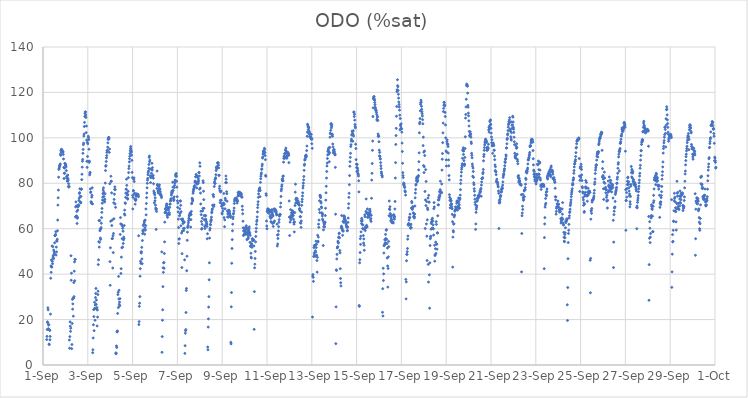
| Category | ODO (%sat) |
|---|---|
| 44440.166666666664 | 11.2 |
| 44440.177083333336 | 12.6 |
| 44440.1875 | 15.6 |
| 44440.197916666664 | 19 |
| 44440.208333333336 | 18.6 |
| 44440.21875 | 25.2 |
| 44440.229166666664 | 24.3 |
| 44440.239583333336 | 16 |
| 44440.25 | 17.6 |
| 44440.260416666664 | 17.8 |
| 44440.270833333336 | 9.2 |
| 44440.28125 | 9 |
| 44440.291666666664 | 15.5 |
| 44440.302083333336 | 15.2 |
| 44440.3125 | 11.1 |
| 44440.322916666664 | 12.6 |
| 44440.333333333336 | 22.4 |
| 44440.34375 | 38.2 |
| 44440.354166666664 | 43.6 |
| 44440.364583333336 | 40.8 |
| 44440.375 | 46.3 |
| 44440.385416666664 | 43.2 |
| 44440.395833333336 | 43.1 |
| 44440.40625 | 52.4 |
| 44440.416666666664 | 45.6 |
| 44440.427083333336 | 44.6 |
| 44440.4375 | 52.1 |
| 44440.447916666664 | 48 |
| 44440.458333333336 | 47.3 |
| 44440.46875 | 46.8 |
| 44440.479166666664 | 50.6 |
| 44440.489583333336 | 48.6 |
| 44440.5 | 49.9 |
| 44440.510416666664 | 49.2 |
| 44440.520833333336 | 53.8 |
| 44440.53125 | 57 |
| 44440.541666666664 | 56.9 |
| 44440.552083333336 | 57.2 |
| 44440.5625 | 57.5 |
| 44440.572916666664 | 58.7 |
| 44440.583333333336 | 48.4 |
| 44440.59375 | 51.9 |
| 44440.604166666664 | 49.8 |
| 44440.614583333336 | 54.7 |
| 44440.625 | 54.5 |
| 44440.635416666664 | 55.4 |
| 44440.645833333336 | 59.1 |
| 44440.65625 | 63.8 |
| 44440.666666666664 | 70.4 |
| 44440.677083333336 | 73.6 |
| 44440.6875 | 77 |
| 44440.697916666664 | 82.7 |
| 44440.708333333336 | 86.1 |
| 44440.71875 | 86.4 |
| 44440.729166666664 | 87.1 |
| 44440.739583333336 | 87.8 |
| 44440.75 | 87.6 |
| 44440.760416666664 | 88.1 |
| 44440.770833333336 | 88.5 |
| 44440.78125 | 92.9 |
| 44440.791666666664 | 92.3 |
| 44440.802083333336 | 94.5 |
| 44440.8125 | 93.8 |
| 44440.822916666664 | 95 |
| 44440.833333333336 | 94.3 |
| 44440.84375 | 94.7 |
| 44440.854166666664 | 94.1 |
| 44440.864583333336 | 94.3 |
| 44440.875 | 93.8 |
| 44440.885416666664 | 93.7 |
| 44440.895833333336 | 93.9 |
| 44440.90625 | 92.7 |
| 44440.916666666664 | 90.7 |
| 44440.927083333336 | 87 |
| 44440.9375 | 82.1 |
| 44440.947916666664 | 84.4 |
| 44440.958333333336 | 86.7 |
| 44440.96875 | 84.4 |
| 44440.979166666664 | 88.8 |
| 44440.989583333336 | 88.6 |
| 44441.0 | 88.1 |
| 44441.010416666664 | 88.1 |
| 44441.020833333336 | 88 |
| 44441.03125 | 87.2 |
| 44441.041666666664 | 85.6 |
| 44441.052083333336 | 82.8 |
| 44441.0625 | 82.2 |
| 44441.072916666664 | 83.2 |
| 44441.083333333336 | 81 |
| 44441.09375 | 81 |
| 44441.104166666664 | 83.6 |
| 44441.114583333336 | 82.1 |
| 44441.125 | 81.4 |
| 44441.135416666664 | 78.6 |
| 44441.145833333336 | 79.8 |
| 44441.15625 | 78.3 |
| 44441.166666666664 | 78.6 |
| 44441.177083333336 | 11 |
| 44441.1875 | 7.4 |
| 44441.197916666664 | 12.5 |
| 44441.208333333336 | 19 |
| 44441.21875 | 17.1 |
| 44441.229166666664 | 14.8 |
| 44441.239583333336 | 16.2 |
| 44441.25 | 48.1 |
| 44441.260416666664 | 37.3 |
| 44441.270833333336 | 40.4 |
| 44441.28125 | 7.2 |
| 44441.291666666664 | 9 |
| 44441.302083333336 | 18.3 |
| 44441.3125 | 28.9 |
| 44441.322916666664 | 24.6 |
| 44441.333333333336 | 26.9 |
| 44441.34375 | 29.4 |
| 44441.354166666664 | 21.5 |
| 44441.364583333336 | 29.4 |
| 44441.375 | 36.3 |
| 44441.385416666664 | 30.1 |
| 44441.395833333336 | 41.3 |
| 44441.40625 | 45.4 |
| 44441.416666666664 | 37.1 |
| 44441.427083333336 | 46.5 |
| 44441.4375 | 46.5 |
| 44441.447916666664 | 65.2 |
| 44441.458333333336 | 69.6 |
| 44441.46875 | 71.8 |
| 44441.479166666664 | 65.5 |
| 44441.489583333336 | 70 |
| 44441.5 | 65.6 |
| 44441.510416666664 | 67.6 |
| 44441.520833333336 | 62.3 |
| 44441.53125 | 64.6 |
| 44441.541666666664 | 65 |
| 44441.552083333336 | 68.2 |
| 44441.5625 | 69.6 |
| 44441.572916666664 | 70.5 |
| 44441.583333333336 | 70.1 |
| 44441.59375 | 70.2 |
| 44441.604166666664 | 72.4 |
| 44441.614583333336 | 73.4 |
| 44441.625 | 75.5 |
| 44441.635416666664 | 75.9 |
| 44441.645833333336 | 77.6 |
| 44441.65625 | 74.2 |
| 44441.666666666664 | 71.8 |
| 44441.677083333336 | 71.4 |
| 44441.6875 | 71.5 |
| 44441.697916666664 | 74.2 |
| 44441.708333333336 | 77.3 |
| 44441.71875 | 77.5 |
| 44441.729166666664 | 81.6 |
| 44441.739583333336 | 84 |
| 44441.75 | 87.1 |
| 44441.760416666664 | 89.7 |
| 44441.770833333336 | 90.5 |
| 44441.78125 | 93.2 |
| 44441.791666666664 | 94.9 |
| 44441.802083333336 | 97 |
| 44441.8125 | 97.7 |
| 44441.822916666664 | 100.8 |
| 44441.833333333336 | 101.7 |
| 44441.84375 | 105 |
| 44441.854166666664 | 106.8 |
| 44441.864583333336 | 109.4 |
| 44441.875 | 110.8 |
| 44441.885416666664 | 111.4 |
| 44441.895833333336 | 111.4 |
| 44441.90625 | 110.1 |
| 44441.916666666664 | 109 |
| 44441.927083333336 | 102.3 |
| 44441.9375 | 105.2 |
| 44441.947916666664 | 99 |
| 44441.958333333336 | 89.7 |
| 44441.96875 | 87 |
| 44441.979166666664 | 98 |
| 44441.989583333336 | 91.8 |
| 44442.0 | 97.4 |
| 44442.010416666664 | 89.7 |
| 44442.020833333336 | 100.7 |
| 44442.03125 | 100 |
| 44442.041666666664 | 99.2 |
| 44442.052083333336 | 95 |
| 44442.0625 | 89.2 |
| 44442.072916666664 | 89.7 |
| 44442.083333333336 | 83.7 |
| 44442.09375 | 84.5 |
| 44442.104166666664 | 84.8 |
| 44442.114583333336 | 77.5 |
| 44442.125 | 75.9 |
| 44442.135416666664 | 76.2 |
| 44442.145833333336 | 71.9 |
| 44442.15625 | 71.6 |
| 44442.166666666664 | 71.2 |
| 44442.177083333336 | 73.9 |
| 44442.1875 | 74.7 |
| 44442.197916666664 | 78 |
| 44442.208333333336 | 70.9 |
| 44442.21875 | 5.4 |
| 44442.229166666664 | 6.7 |
| 44442.239583333336 | 11.9 |
| 44442.25 | 17.7 |
| 44442.260416666664 | 24.4 |
| 44442.270833333336 | 21.3 |
| 44442.28125 | 15.1 |
| 44442.291666666664 | 24.6 |
| 44442.302083333336 | 27.6 |
| 44442.3125 | 25 |
| 44442.322916666664 | 19.7 |
| 44442.333333333336 | 26.4 |
| 44442.34375 | 29.7 |
| 44442.354166666664 | 31.5 |
| 44442.364583333336 | 33.7 |
| 44442.375 | 26.7 |
| 44442.385416666664 | 28.6 |
| 44442.395833333336 | 24.8 |
| 44442.40625 | 25.3 |
| 44442.416666666664 | 17.2 |
| 44442.427083333336 | 24.2 |
| 44442.4375 | 21.1 |
| 44442.447916666664 | 31 |
| 44442.458333333336 | 32.5 |
| 44442.46875 | 44.2 |
| 44442.479166666664 | 46.3 |
| 44442.489583333336 | 54.3 |
| 44442.5 | 63.6 |
| 44442.510416666664 | 51.9 |
| 44442.520833333336 | 54 |
| 44442.53125 | 63.6 |
| 44442.541666666664 | 59.1 |
| 44442.552083333336 | 59.8 |
| 44442.5625 | 55.9 |
| 44442.572916666664 | 55.3 |
| 44442.583333333336 | 60 |
| 44442.59375 | 60.5 |
| 44442.604166666664 | 62.4 |
| 44442.614583333336 | 64.9 |
| 44442.625 | 67.2 |
| 44442.635416666664 | 68.9 |
| 44442.645833333336 | 71.2 |
| 44442.65625 | 72.6 |
| 44442.666666666664 | 73.9 |
| 44442.677083333336 | 75.4 |
| 44442.6875 | 77 |
| 44442.697916666664 | 78 |
| 44442.708333333336 | 76.1 |
| 44442.71875 | 74.2 |
| 44442.729166666664 | 72.7 |
| 44442.739583333336 | 72.1 |
| 44442.75 | 71.8 |
| 44442.760416666664 | 73 |
| 44442.770833333336 | 75.4 |
| 44442.78125 | 80.1 |
| 44442.791666666664 | 85.6 |
| 44442.802083333336 | 87.5 |
| 44442.8125 | 87.8 |
| 44442.822916666664 | 89.6 |
| 44442.833333333336 | 91.2 |
| 44442.84375 | 92.2 |
| 44442.854166666664 | 93.6 |
| 44442.864583333336 | 94.5 |
| 44442.875 | 94.3 |
| 44442.885416666664 | 95.9 |
| 44442.895833333336 | 97.8 |
| 44442.90625 | 99.3 |
| 44442.916666666664 | 100 |
| 44442.927083333336 | 100.1 |
| 44442.9375 | 100.2 |
| 44442.947916666664 | 99.5 |
| 44442.958333333336 | 93.6 |
| 44442.96875 | 95.1 |
| 44442.979166666664 | 79.8 |
| 44442.989583333336 | 45.5 |
| 44443.0 | 35.1 |
| 44443.010416666664 | 51.6 |
| 44443.020833333336 | 63.3 |
| 44443.03125 | 83.1 |
| 44443.041666666664 | 80.8 |
| 44443.052083333336 | 80.9 |
| 44443.0625 | 75.8 |
| 44443.072916666664 | 61.4 |
| 44443.083333333336 | 55.6 |
| 44443.09375 | 63.8 |
| 44443.104166666664 | 55.7 |
| 44443.114583333336 | 42.7 |
| 44443.125 | 56.9 |
| 44443.135416666664 | 49.5 |
| 44443.145833333336 | 57.9 |
| 44443.15625 | 71.4 |
| 44443.166666666664 | 64.4 |
| 44443.177083333336 | 72.9 |
| 44443.1875 | 75.2 |
| 44443.197916666664 | 77.3 |
| 44443.208333333336 | 78.4 |
| 44443.21875 | 70.9 |
| 44443.229166666664 | 77.2 |
| 44443.239583333336 | 69.4 |
| 44443.25 | 5.3 |
| 44443.260416666664 | 4.9 |
| 44443.270833333336 | 5.2 |
| 44443.28125 | 8.4 |
| 44443.291666666664 | 7.7 |
| 44443.302083333336 | 14.6 |
| 44443.3125 | 14.6 |
| 44443.322916666664 | 15 |
| 44443.333333333336 | 22.7 |
| 44443.34375 | 31 |
| 44443.354166666664 | 32 |
| 44443.364583333336 | 25.3 |
| 44443.375 | 39 |
| 44443.385416666664 | 29.1 |
| 44443.395833333336 | 32.9 |
| 44443.40625 | 26.7 |
| 44443.416666666664 | 27.7 |
| 44443.427083333336 | 26.1 |
| 44443.4375 | 29.2 |
| 44443.447916666664 | 57.5 |
| 44443.458333333336 | 64.9 |
| 44443.46875 | 62.1 |
| 44443.479166666664 | 40.3 |
| 44443.489583333336 | 42.4 |
| 44443.5 | 47.5 |
| 44443.510416666664 | 61.9 |
| 44443.520833333336 | 51.6 |
| 44443.53125 | 55.6 |
| 44443.541666666664 | 61.2 |
| 44443.552083333336 | 51.9 |
| 44443.5625 | 60.2 |
| 44443.572916666664 | 58.9 |
| 44443.583333333336 | 53.5 |
| 44443.59375 | 55.1 |
| 44443.604166666664 | 56.3 |
| 44443.614583333336 | 55.6 |
| 44443.625 | 61.4 |
| 44443.635416666664 | 66.5 |
| 44443.645833333336 | 68.2 |
| 44443.65625 | 66 |
| 44443.666666666664 | 71.4 |
| 44443.677083333336 | 71.1 |
| 44443.6875 | 73.8 |
| 44443.697916666664 | 75.7 |
| 44443.708333333336 | 77.4 |
| 44443.71875 | 77.4 |
| 44443.729166666664 | 81.8 |
| 44443.739583333336 | 79.1 |
| 44443.75 | 75.7 |
| 44443.760416666664 | 74.9 |
| 44443.770833333336 | 73.4 |
| 44443.78125 | 73 |
| 44443.791666666664 | 74.9 |
| 44443.802083333336 | 76.5 |
| 44443.8125 | 82.5 |
| 44443.822916666664 | 84.7 |
| 44443.833333333336 | 86.5 |
| 44443.84375 | 87.6 |
| 44443.854166666664 | 89.4 |
| 44443.864583333336 | 90.8 |
| 44443.875 | 91.9 |
| 44443.885416666664 | 93.1 |
| 44443.895833333336 | 94.3 |
| 44443.90625 | 95.4 |
| 44443.916666666664 | 96.2 |
| 44443.927083333336 | 95 |
| 44443.9375 | 94.2 |
| 44443.947916666664 | 93.8 |
| 44443.958333333336 | 92.4 |
| 44443.96875 | 90.1 |
| 44443.979166666664 | 84.8 |
| 44443.989583333336 | 82.5 |
| 44444.0 | 74.7 |
| 44444.010416666664 | 68.7 |
| 44444.020833333336 | 73.8 |
| 44444.03125 | 76.7 |
| 44444.041666666664 | 76.8 |
| 44444.052083333336 | 81.8 |
| 44444.0625 | 82.4 |
| 44444.072916666664 | 80.8 |
| 44444.083333333336 | 75.3 |
| 44444.09375 | 75.6 |
| 44444.104166666664 | 72.9 |
| 44444.114583333336 | 70.8 |
| 44444.125 | 73.1 |
| 44444.135416666664 | 72.4 |
| 44444.145833333336 | 72.9 |
| 44444.15625 | 74.3 |
| 44444.166666666664 | 74.5 |
| 44444.177083333336 | 75.3 |
| 44444.1875 | 74.7 |
| 44444.197916666664 | 75.3 |
| 44444.208333333336 | 74.7 |
| 44444.21875 | 74.7 |
| 44444.229166666664 | 75 |
| 44444.239583333336 | 75.1 |
| 44444.25 | 74.5 |
| 44444.260416666664 | 74.1 |
| 44444.270833333336 | 56.9 |
| 44444.28125 | 17.8 |
| 44444.291666666664 | 19.1 |
| 44444.302083333336 | 25.8 |
| 44444.3125 | 27.2 |
| 44444.322916666664 | 30.1 |
| 44444.333333333336 | 39.1 |
| 44444.34375 | 42.4 |
| 44444.354166666664 | 45.7 |
| 44444.364583333336 | 44.8 |
| 44444.375 | 49.8 |
| 44444.385416666664 | 49.3 |
| 44444.395833333336 | 49.8 |
| 44444.40625 | 51.8 |
| 44444.416666666664 | 46.7 |
| 44444.427083333336 | 44.6 |
| 44444.4375 | 54.8 |
| 44444.447916666664 | 57.8 |
| 44444.458333333336 | 59.3 |
| 44444.46875 | 58.7 |
| 44444.479166666664 | 61.4 |
| 44444.489583333336 | 59.4 |
| 44444.5 | 61.8 |
| 44444.510416666664 | 62.1 |
| 44444.520833333336 | 62.9 |
| 44444.53125 | 63.5 |
| 44444.541666666664 | 57.6 |
| 44444.552083333336 | 60.4 |
| 44444.5625 | 63.8 |
| 44444.572916666664 | 59.4 |
| 44444.583333333336 | 61.4 |
| 44444.59375 | 68.7 |
| 44444.604166666664 | 66.1 |
| 44444.614583333336 | 71.1 |
| 44444.625 | 73.7 |
| 44444.635416666664 | 75.7 |
| 44444.645833333336 | 78 |
| 44444.65625 | 80 |
| 44444.666666666664 | 81.4 |
| 44444.677083333336 | 82.2 |
| 44444.6875 | 83.8 |
| 44444.697916666664 | 84.7 |
| 44444.708333333336 | 85.4 |
| 44444.71875 | 86.6 |
| 44444.729166666664 | 88.3 |
| 44444.739583333336 | 91.4 |
| 44444.75 | 92 |
| 44444.760416666664 | 89.5 |
| 44444.770833333336 | 90.2 |
| 44444.78125 | 86.3 |
| 44444.791666666664 | 83.3 |
| 44444.802083333336 | 80.3 |
| 44444.8125 | 82.5 |
| 44444.822916666664 | 82.8 |
| 44444.833333333336 | 83 |
| 44444.84375 | 84.4 |
| 44444.854166666664 | 86.1 |
| 44444.864583333336 | 88.8 |
| 44444.875 | 85.8 |
| 44444.885416666664 | 86.9 |
| 44444.895833333336 | 82.6 |
| 44444.90625 | 83.2 |
| 44444.916666666664 | 83.5 |
| 44444.927083333336 | 82.2 |
| 44444.9375 | 79.8 |
| 44444.947916666664 | 76.6 |
| 44444.958333333336 | 75.7 |
| 44444.96875 | 71.4 |
| 44444.979166666664 | 75.8 |
| 44444.989583333336 | 74.9 |
| 44445.0 | 72.3 |
| 44445.010416666664 | 73.6 |
| 44445.020833333336 | 70.4 |
| 44445.03125 | 69.1 |
| 44445.041666666664 | 68.4 |
| 44445.052083333336 | 59.7 |
| 44445.0625 | 68.8 |
| 44445.072916666664 | 67.6 |
| 44445.083333333336 | 77.7 |
| 44445.09375 | 85.4 |
| 44445.104166666664 | 79.1 |
| 44445.114583333336 | 79.5 |
| 44445.125 | 79.1 |
| 44445.135416666664 | 76.5 |
| 44445.145833333336 | 75.7 |
| 44445.15625 | 78.6 |
| 44445.166666666664 | 77 |
| 44445.177083333336 | 78.7 |
| 44445.1875 | 77.1 |
| 44445.197916666664 | 79.3 |
| 44445.208333333336 | 77.7 |
| 44445.21875 | 77.3 |
| 44445.229166666664 | 75.3 |
| 44445.239583333336 | 76.2 |
| 44445.25 | 74.8 |
| 44445.260416666664 | 75.1 |
| 44445.270833333336 | 74.6 |
| 44445.28125 | 74.3 |
| 44445.291666666664 | 73.7 |
| 44445.302083333336 | 49.8 |
| 44445.3125 | 5.6 |
| 44445.322916666664 | 12.5 |
| 44445.333333333336 | 19.7 |
| 44445.34375 | 24.3 |
| 44445.354166666664 | 34.5 |
| 44445.364583333336 | 42.8 |
| 44445.375 | 40.8 |
| 44445.385416666664 | 45 |
| 44445.395833333336 | 45.1 |
| 44445.40625 | 42.6 |
| 44445.416666666664 | 49.1 |
| 44445.427083333336 | 54.2 |
| 44445.4375 | 62.9 |
| 44445.447916666664 | 67 |
| 44445.458333333336 | 68.7 |
| 44445.46875 | 67.2 |
| 44445.479166666664 | 67.5 |
| 44445.489583333336 | 68.4 |
| 44445.5 | 69.5 |
| 44445.510416666664 | 70.2 |
| 44445.520833333336 | 70.9 |
| 44445.53125 | 70.7 |
| 44445.541666666664 | 65.8 |
| 44445.552083333336 | 66.6 |
| 44445.5625 | 65 |
| 44445.572916666664 | 68.4 |
| 44445.583333333336 | 69.4 |
| 44445.59375 | 68.8 |
| 44445.604166666664 | 68.3 |
| 44445.614583333336 | 66.7 |
| 44445.625 | 66.5 |
| 44445.635416666664 | 67.1 |
| 44445.645833333336 | 66.2 |
| 44445.65625 | 69.4 |
| 44445.666666666664 | 70.8 |
| 44445.677083333336 | 70.9 |
| 44445.6875 | 72.2 |
| 44445.697916666664 | 72.4 |
| 44445.708333333336 | 73 |
| 44445.71875 | 73.2 |
| 44445.729166666664 | 74.8 |
| 44445.739583333336 | 75.8 |
| 44445.75 | 76.5 |
| 44445.760416666664 | 75.6 |
| 44445.770833333336 | 76.1 |
| 44445.78125 | 76.7 |
| 44445.791666666664 | 80.5 |
| 44445.802083333336 | 78.3 |
| 44445.8125 | 76.8 |
| 44445.822916666664 | 73.5 |
| 44445.833333333336 | 72.4 |
| 44445.84375 | 72.8 |
| 44445.854166666664 | 74 |
| 44445.864583333336 | 78.1 |
| 44445.875 | 79.1 |
| 44445.885416666664 | 80.1 |
| 44445.895833333336 | 81.4 |
| 44445.90625 | 81 |
| 44445.916666666664 | 83.8 |
| 44445.927083333336 | 83.1 |
| 44445.9375 | 83.6 |
| 44445.947916666664 | 84.3 |
| 44445.958333333336 | 83.1 |
| 44445.96875 | 80.9 |
| 44445.979166666664 | 78.3 |
| 44445.989583333336 | 74.1 |
| 44446.0 | 72.3 |
| 44446.010416666664 | 69.4 |
| 44446.020833333336 | 71.3 |
| 44446.03125 | 67.4 |
| 44446.041666666664 | 64.2 |
| 44446.052083333336 | 60.5 |
| 44446.0625 | 53.5 |
| 44446.072916666664 | 55.4 |
| 44446.083333333336 | 55.6 |
| 44446.09375 | 65.7 |
| 44446.104166666664 | 68.8 |
| 44446.114583333336 | 66.7 |
| 44446.125 | 72.1 |
| 44446.135416666664 | 72.3 |
| 44446.145833333336 | 70.3 |
| 44446.15625 | 61.3 |
| 44446.166666666664 | 67.5 |
| 44446.177083333336 | 64.2 |
| 44446.1875 | 58.1 |
| 44446.197916666664 | 42.9 |
| 44446.208333333336 | 49 |
| 44446.21875 | 58.9 |
| 44446.229166666664 | 63.6 |
| 44446.239583333336 | 64.3 |
| 44446.25 | 62.3 |
| 44446.260416666664 | 63.1 |
| 44446.270833333336 | 60.1 |
| 44446.28125 | 59.2 |
| 44446.291666666664 | 63.1 |
| 44446.302083333336 | 62.8 |
| 44446.3125 | 60.2 |
| 44446.322916666664 | 46.3 |
| 44446.333333333336 | 5.1 |
| 44446.34375 | 8.5 |
| 44446.354166666664 | 14 |
| 44446.364583333336 | 15.1 |
| 44446.375 | 15.6 |
| 44446.385416666664 | 23.1 |
| 44446.395833333336 | 32.8 |
| 44446.40625 | 33.7 |
| 44446.416666666664 | 41.5 |
| 44446.427083333336 | 47.9 |
| 44446.4375 | 54.9 |
| 44446.447916666664 | 58.5 |
| 44446.458333333336 | 60.6 |
| 44446.46875 | 60.8 |
| 44446.479166666664 | 61.5 |
| 44446.489583333336 | 62.6 |
| 44446.5 | 63.5 |
| 44446.510416666664 | 64.6 |
| 44446.520833333336 | 65.6 |
| 44446.53125 | 64.2 |
| 44446.541666666664 | 66.2 |
| 44446.552083333336 | 65.9 |
| 44446.5625 | 66.7 |
| 44446.572916666664 | 67 |
| 44446.583333333336 | 66.5 |
| 44446.59375 | 60.7 |
| 44446.604166666664 | 64 |
| 44446.614583333336 | 66.2 |
| 44446.625 | 67.6 |
| 44446.635416666664 | 71 |
| 44446.645833333336 | 71.3 |
| 44446.65625 | 73.4 |
| 44446.666666666664 | 73.1 |
| 44446.677083333336 | 72.2 |
| 44446.6875 | 72.6 |
| 44446.697916666664 | 75.6 |
| 44446.708333333336 | 76.3 |
| 44446.71875 | 77 |
| 44446.729166666664 | 77.4 |
| 44446.739583333336 | 77.8 |
| 44446.75 | 78.6 |
| 44446.760416666664 | 78.3 |
| 44446.770833333336 | 79 |
| 44446.78125 | 80.5 |
| 44446.791666666664 | 81 |
| 44446.802083333336 | 80.8 |
| 44446.8125 | 82.9 |
| 44446.822916666664 | 82.9 |
| 44446.833333333336 | 83.9 |
| 44446.84375 | 80.3 |
| 44446.854166666664 | 80 |
| 44446.864583333336 | 78 |
| 44446.875 | 79.6 |
| 44446.885416666664 | 83.2 |
| 44446.895833333336 | 82.7 |
| 44446.90625 | 80.7 |
| 44446.916666666664 | 80.4 |
| 44446.927083333336 | 80 |
| 44446.9375 | 81.9 |
| 44446.947916666664 | 81 |
| 44446.958333333336 | 84.7 |
| 44446.96875 | 84.7 |
| 44446.979166666664 | 83.2 |
| 44446.989583333336 | 77.4 |
| 44447.0 | 89 |
| 44447.010416666664 | 87.5 |
| 44447.020833333336 | 77.9 |
| 44447.03125 | 75.7 |
| 44447.041666666664 | 70.9 |
| 44447.052083333336 | 67.7 |
| 44447.0625 | 66.2 |
| 44447.072916666664 | 63.2 |
| 44447.083333333336 | 59.8 |
| 44447.09375 | 60.1 |
| 44447.104166666664 | 61.9 |
| 44447.114583333336 | 64.6 |
| 44447.125 | 67.8 |
| 44447.135416666664 | 68.9 |
| 44447.145833333336 | 81.1 |
| 44447.15625 | 80.3 |
| 44447.166666666664 | 76.5 |
| 44447.177083333336 | 72.8 |
| 44447.1875 | 69 |
| 44447.197916666664 | 65.8 |
| 44447.208333333336 | 63.9 |
| 44447.21875 | 61.1 |
| 44447.229166666664 | 60.1 |
| 44447.239583333336 | 65.6 |
| 44447.25 | 63.8 |
| 44447.260416666664 | 65.8 |
| 44447.270833333336 | 64.2 |
| 44447.28125 | 61.7 |
| 44447.291666666664 | 63.2 |
| 44447.302083333336 | 62.5 |
| 44447.3125 | 62.1 |
| 44447.322916666664 | 61 |
| 44447.333333333336 | 55.6 |
| 44447.34375 | 57.8 |
| 44447.354166666664 | 7.9 |
| 44447.364583333336 | 6.7 |
| 44447.375 | 16.7 |
| 44447.385416666664 | 20.3 |
| 44447.395833333336 | 25.5 |
| 44447.40625 | 30.1 |
| 44447.416666666664 | 37.5 |
| 44447.427083333336 | 45 |
| 44447.4375 | 55.9 |
| 44447.447916666664 | 59.4 |
| 44447.458333333336 | 60.2 |
| 44447.46875 | 61.9 |
| 44447.479166666664 | 61.7 |
| 44447.489583333336 | 63.1 |
| 44447.5 | 63.6 |
| 44447.510416666664 | 64.1 |
| 44447.520833333336 | 65.1 |
| 44447.53125 | 67 |
| 44447.541666666664 | 67.4 |
| 44447.552083333336 | 68.3 |
| 44447.5625 | 68.8 |
| 44447.572916666664 | 70.3 |
| 44447.583333333336 | 70.3 |
| 44447.59375 | 74.9 |
| 44447.604166666664 | 75 |
| 44447.614583333336 | 74.1 |
| 44447.625 | 69.8 |
| 44447.635416666664 | 70.5 |
| 44447.645833333336 | 78.6 |
| 44447.65625 | 80.6 |
| 44447.666666666664 | 80 |
| 44447.677083333336 | 81.6 |
| 44447.6875 | 79.9 |
| 44447.697916666664 | 82 |
| 44447.708333333336 | 82.5 |
| 44447.71875 | 83.8 |
| 44447.729166666664 | 85.6 |
| 44447.739583333336 | 87 |
| 44447.75 | 86.4 |
| 44447.760416666664 | 87.3 |
| 44447.770833333336 | 87.2 |
| 44447.78125 | 86.8 |
| 44447.791666666664 | 89 |
| 44447.802083333336 | 88.9 |
| 44447.8125 | 88.9 |
| 44447.822916666664 | 89 |
| 44447.833333333336 | 88 |
| 44447.84375 | 86.8 |
| 44447.854166666664 | 83.5 |
| 44447.864583333336 | 83.5 |
| 44447.875 | 77.7 |
| 44447.885416666664 | 78.7 |
| 44447.895833333336 | 76.7 |
| 44447.90625 | 71.5 |
| 44447.916666666664 | 72.5 |
| 44447.927083333336 | 76.2 |
| 44447.9375 | 76.5 |
| 44447.947916666664 | 76.6 |
| 44447.958333333336 | 72.5 |
| 44447.96875 | 69.9 |
| 44447.979166666664 | 71 |
| 44447.989583333336 | 66.9 |
| 44448.0 | 66.5 |
| 44448.010416666664 | 70.6 |
| 44448.020833333336 | 68.9 |
| 44448.03125 | 67.8 |
| 44448.041666666664 | 70.4 |
| 44448.052083333336 | 71 |
| 44448.0625 | 71.3 |
| 44448.072916666664 | 75.5 |
| 44448.083333333336 | 64.9 |
| 44448.09375 | 70.8 |
| 44448.104166666664 | 60.9 |
| 44448.114583333336 | 63.9 |
| 44448.125 | 68.8 |
| 44448.135416666664 | 73.4 |
| 44448.145833333336 | 72.6 |
| 44448.15625 | 80.3 |
| 44448.166666666664 | 83.2 |
| 44448.177083333336 | 81.8 |
| 44448.1875 | 80.3 |
| 44448.197916666664 | 76.3 |
| 44448.208333333336 | 75.4 |
| 44448.21875 | 72.1 |
| 44448.229166666664 | 67.9 |
| 44448.239583333336 | 65.2 |
| 44448.25 | 66.5 |
| 44448.260416666664 | 67.4 |
| 44448.270833333336 | 67.7 |
| 44448.28125 | 65.1 |
| 44448.291666666664 | 66.5 |
| 44448.302083333336 | 68.2 |
| 44448.3125 | 67.9 |
| 44448.322916666664 | 67.5 |
| 44448.333333333336 | 66.8 |
| 44448.34375 | 66.1 |
| 44448.354166666664 | 65.8 |
| 44448.364583333336 | 65.5 |
| 44448.375 | 65 |
| 44448.385416666664 | 10 |
| 44448.395833333336 | 9.3 |
| 44448.40625 | 25.6 |
| 44448.416666666664 | 31.9 |
| 44448.427083333336 | 44.8 |
| 44448.4375 | 51.3 |
| 44448.447916666664 | 55.2 |
| 44448.458333333336 | 59.1 |
| 44448.46875 | 62 |
| 44448.479166666664 | 64.4 |
| 44448.489583333336 | 65.2 |
| 44448.5 | 66.5 |
| 44448.510416666664 | 66.8 |
| 44448.520833333336 | 67.9 |
| 44448.53125 | 69.1 |
| 44448.541666666664 | 71.1 |
| 44448.552083333336 | 72.2 |
| 44448.5625 | 72.8 |
| 44448.572916666664 | 73.3 |
| 44448.583333333336 | 73 |
| 44448.59375 | 73.2 |
| 44448.604166666664 | 72.8 |
| 44448.614583333336 | 73.5 |
| 44448.625 | 73.1 |
| 44448.635416666664 | 72.7 |
| 44448.645833333336 | 72.8 |
| 44448.65625 | 72.9 |
| 44448.666666666664 | 71.3 |
| 44448.677083333336 | 72.4 |
| 44448.6875 | 72.1 |
| 44448.697916666664 | 74.3 |
| 44448.708333333336 | 75.9 |
| 44448.71875 | 74.9 |
| 44448.729166666664 | 75.3 |
| 44448.739583333336 | 76 |
| 44448.75 | 76.2 |
| 44448.760416666664 | 74.8 |
| 44448.770833333336 | 74.9 |
| 44448.78125 | 74.8 |
| 44448.791666666664 | 75.7 |
| 44448.802083333336 | 75.5 |
| 44448.8125 | 75.8 |
| 44448.822916666664 | 75.6 |
| 44448.833333333336 | 75.6 |
| 44448.84375 | 75.6 |
| 44448.854166666664 | 75 |
| 44448.864583333336 | 74.2 |
| 44448.875 | 73.9 |
| 44448.885416666664 | 73.9 |
| 44448.895833333336 | 69.9 |
| 44448.90625 | 68.3 |
| 44448.916666666664 | 66.6 |
| 44448.927083333336 | 63.3 |
| 44448.9375 | 60.4 |
| 44448.947916666664 | 57 |
| 44448.958333333336 | 59 |
| 44448.96875 | 59.1 |
| 44448.979166666664 | 57.5 |
| 44448.989583333336 | 59.3 |
| 44449.0 | 57.6 |
| 44449.010416666664 | 58.7 |
| 44449.020833333336 | 60.4 |
| 44449.03125 | 57.5 |
| 44449.041666666664 | 58.8 |
| 44449.052083333336 | 58.3 |
| 44449.0625 | 59.8 |
| 44449.072916666664 | 61.3 |
| 44449.083333333336 | 60.6 |
| 44449.09375 | 60.1 |
| 44449.104166666664 | 55.2 |
| 44449.114583333336 | 58.1 |
| 44449.125 | 59.6 |
| 44449.135416666664 | 57.7 |
| 44449.145833333336 | 57.1 |
| 44449.15625 | 55.6 |
| 44449.166666666664 | 56.2 |
| 44449.177083333336 | 58.7 |
| 44449.1875 | 59.2 |
| 44449.197916666664 | 60 |
| 44449.208333333336 | 60.8 |
| 44449.21875 | 57.8 |
| 44449.229166666664 | 58.3 |
| 44449.239583333336 | 54 |
| 44449.25 | 57.1 |
| 44449.260416666664 | 52.2 |
| 44449.270833333336 | 52.6 |
| 44449.28125 | 49.2 |
| 44449.291666666664 | 47.5 |
| 44449.302083333336 | 47.1 |
| 44449.3125 | 53.4 |
| 44449.322916666664 | 51.8 |
| 44449.333333333336 | 52.8 |
| 44449.34375 | 55.6 |
| 44449.354166666664 | 54.7 |
| 44449.364583333336 | 55.5 |
| 44449.375 | 55.3 |
| 44449.385416666664 | 55.2 |
| 44449.395833333336 | 55.1 |
| 44449.40625 | 54.9 |
| 44449.416666666664 | 52.4 |
| 44449.427083333336 | 15.7 |
| 44449.4375 | 32.3 |
| 44449.447916666664 | 42.8 |
| 44449.458333333336 | 44.4 |
| 44449.46875 | 46.9 |
| 44449.479166666664 | 50 |
| 44449.489583333336 | 54.2 |
| 44449.5 | 56.6 |
| 44449.510416666664 | 58.7 |
| 44449.520833333336 | 60.2 |
| 44449.53125 | 61.9 |
| 44449.541666666664 | 63.2 |
| 44449.552083333336 | 63.8 |
| 44449.5625 | 65.2 |
| 44449.572916666664 | 67.4 |
| 44449.583333333336 | 69.3 |
| 44449.59375 | 70.6 |
| 44449.604166666664 | 71.9 |
| 44449.614583333336 | 73.8 |
| 44449.625 | 75.3 |
| 44449.635416666664 | 76.6 |
| 44449.645833333336 | 77 |
| 44449.65625 | 77.5 |
| 44449.666666666664 | 77.4 |
| 44449.677083333336 | 78 |
| 44449.6875 | 74.1 |
| 44449.697916666664 | 76.8 |
| 44449.708333333336 | 80.4 |
| 44449.71875 | 82 |
| 44449.729166666664 | 83.1 |
| 44449.739583333336 | 84 |
| 44449.75 | 84.6 |
| 44449.760416666664 | 86.1 |
| 44449.770833333336 | 86.3 |
| 44449.78125 | 87.6 |
| 44449.791666666664 | 88.4 |
| 44449.802083333336 | 91.1 |
| 44449.8125 | 91.6 |
| 44449.822916666664 | 92.9 |
| 44449.833333333336 | 94.2 |
| 44449.84375 | 93.7 |
| 44449.854166666664 | 92.9 |
| 44449.864583333336 | 93.6 |
| 44449.875 | 94 |
| 44449.885416666664 | 95.4 |
| 44449.895833333336 | 94.9 |
| 44449.90625 | 93.5 |
| 44449.916666666664 | 92.2 |
| 44449.927083333336 | 90.4 |
| 44449.9375 | 83.5 |
| 44449.947916666664 | 83.1 |
| 44449.958333333336 | 75.4 |
| 44449.96875 | 74.7 |
| 44449.979166666664 | 63.4 |
| 44449.989583333336 | 61.2 |
| 44450.0 | 60 |
| 44450.010416666664 | 67.5 |
| 44450.020833333336 | 67.9 |
| 44450.03125 | 68.5 |
| 44450.041666666664 | 68.8 |
| 44450.052083333336 | 68.2 |
| 44450.0625 | 68.5 |
| 44450.072916666664 | 66.8 |
| 44450.083333333336 | 67.7 |
| 44450.09375 | 68.1 |
| 44450.104166666664 | 67.7 |
| 44450.114583333336 | 68.2 |
| 44450.125 | 68 |
| 44450.135416666664 | 65.3 |
| 44450.145833333336 | 67.4 |
| 44450.15625 | 65.9 |
| 44450.166666666664 | 64.6 |
| 44450.177083333336 | 63.1 |
| 44450.1875 | 62.9 |
| 44450.197916666664 | 64.9 |
| 44450.208333333336 | 67.9 |
| 44450.21875 | 68.4 |
| 44450.229166666664 | 66.5 |
| 44450.239583333336 | 67 |
| 44450.25 | 62.3 |
| 44450.260416666664 | 66 |
| 44450.270833333336 | 65.6 |
| 44450.28125 | 61 |
| 44450.291666666664 | 62.8 |
| 44450.302083333336 | 62.7 |
| 44450.3125 | 68.7 |
| 44450.322916666664 | 68.4 |
| 44450.333333333336 | 63.4 |
| 44450.34375 | 67.8 |
| 44450.354166666664 | 68.7 |
| 44450.364583333336 | 67.7 |
| 44450.375 | 68.1 |
| 44450.385416666664 | 67.7 |
| 44450.395833333336 | 68 |
| 44450.40625 | 67.5 |
| 44450.416666666664 | 66.9 |
| 44450.427083333336 | 66.2 |
| 44450.4375 | 66.1 |
| 44450.447916666664 | 62 |
| 44450.458333333336 | 52.4 |
| 44450.46875 | 57.2 |
| 44450.479166666664 | 53.3 |
| 44450.489583333336 | 55.7 |
| 44450.5 | 57.4 |
| 44450.510416666664 | 59 |
| 44450.520833333336 | 60.9 |
| 44450.53125 | 62.8 |
| 44450.541666666664 | 64 |
| 44450.552083333336 | 65.5 |
| 44450.5625 | 66.1 |
| 44450.572916666664 | 66.3 |
| 44450.583333333336 | 66.1 |
| 44450.59375 | 66.3 |
| 44450.604166666664 | 69.6 |
| 44450.614583333336 | 71.3 |
| 44450.625 | 74.2 |
| 44450.635416666664 | 76.7 |
| 44450.645833333336 | 77.5 |
| 44450.65625 | 78.6 |
| 44450.666666666664 | 79.3 |
| 44450.677083333336 | 81.8 |
| 44450.6875 | 81.1 |
| 44450.697916666664 | 82.1 |
| 44450.708333333336 | 83.1 |
| 44450.71875 | 81.1 |
| 44450.729166666664 | 83.2 |
| 44450.739583333336 | 89.3 |
| 44450.75 | 91 |
| 44450.760416666664 | 91.9 |
| 44450.770833333336 | 91.5 |
| 44450.78125 | 93 |
| 44450.791666666664 | 91 |
| 44450.802083333336 | 91.6 |
| 44450.8125 | 93.2 |
| 44450.822916666664 | 94.7 |
| 44450.833333333336 | 94.4 |
| 44450.84375 | 95.5 |
| 44450.854166666664 | 93.2 |
| 44450.864583333336 | 93.9 |
| 44450.875 | 92 |
| 44450.885416666664 | 91 |
| 44450.895833333336 | 91.7 |
| 44450.90625 | 93.5 |
| 44450.916666666664 | 93.7 |
| 44450.927083333336 | 93.5 |
| 44450.9375 | 93 |
| 44450.947916666664 | 93.3 |
| 44450.958333333336 | 92.8 |
| 44450.96875 | 92.3 |
| 44450.979166666664 | 89.1 |
| 44450.989583333336 | 72.2 |
| 44451.0 | 65.1 |
| 44451.010416666664 | 57 |
| 44451.020833333336 | 65.1 |
| 44451.03125 | 62.9 |
| 44451.041666666664 | 65 |
| 44451.052083333336 | 68.4 |
| 44451.0625 | 63.9 |
| 44451.072916666664 | 65.1 |
| 44451.083333333336 | 65.7 |
| 44451.09375 | 67 |
| 44451.104166666664 | 66.1 |
| 44451.114583333336 | 64.9 |
| 44451.125 | 65.7 |
| 44451.135416666664 | 67.9 |
| 44451.145833333336 | 67.4 |
| 44451.15625 | 66.6 |
| 44451.166666666664 | 67.4 |
| 44451.177083333336 | 65.8 |
| 44451.1875 | 64.1 |
| 44451.197916666664 | 62.7 |
| 44451.208333333336 | 62 |
| 44451.21875 | 58.6 |
| 44451.229166666664 | 63 |
| 44451.239583333336 | 67.1 |
| 44451.25 | 70.2 |
| 44451.260416666664 | 76.1 |
| 44451.270833333336 | 79.6 |
| 44451.28125 | 71.3 |
| 44451.291666666664 | 72.9 |
| 44451.302083333336 | 73.4 |
| 44451.3125 | 72.8 |
| 44451.322916666664 | 72.3 |
| 44451.333333333336 | 72.9 |
| 44451.34375 | 73.3 |
| 44451.354166666664 | 71.5 |
| 44451.364583333336 | 71.1 |
| 44451.375 | 72.3 |
| 44451.385416666664 | 71.6 |
| 44451.395833333336 | 71.8 |
| 44451.40625 | 71.2 |
| 44451.416666666664 | 71 |
| 44451.427083333336 | 70.7 |
| 44451.4375 | 70.3 |
| 44451.447916666664 | 68.6 |
| 44451.458333333336 | 68.9 |
| 44451.46875 | 67.9 |
| 44451.479166666664 | 65.3 |
| 44451.489583333336 | 62.7 |
| 44451.5 | 65.3 |
| 44451.510416666664 | 62.4 |
| 44451.520833333336 | 60.6 |
| 44451.53125 | 63.4 |
| 44451.541666666664 | 67.3 |
| 44451.552083333336 | 70.3 |
| 44451.5625 | 71.9 |
| 44451.572916666664 | 73 |
| 44451.583333333336 | 74.4 |
| 44451.59375 | 75.8 |
| 44451.604166666664 | 77.9 |
| 44451.614583333336 | 78.9 |
| 44451.625 | 80.1 |
| 44451.635416666664 | 81.5 |
| 44451.645833333336 | 83 |
| 44451.65625 | 85.7 |
| 44451.666666666664 | 87.9 |
| 44451.677083333336 | 88.4 |
| 44451.6875 | 90.2 |
| 44451.697916666664 | 90.4 |
| 44451.708333333336 | 91 |
| 44451.71875 | 91.9 |
| 44451.729166666664 | 92.3 |
| 44451.739583333336 | 92 |
| 44451.75 | 92.4 |
| 44451.760416666664 | 91.7 |
| 44451.770833333336 | 94.4 |
| 44451.78125 | 96.4 |
| 44451.791666666664 | 100.7 |
| 44451.802083333336 | 102.5 |
| 44451.8125 | 106 |
| 44451.822916666664 | 105.6 |
| 44451.833333333336 | 104.8 |
| 44451.84375 | 103.6 |
| 44451.854166666664 | 104.8 |
| 44451.864583333336 | 104.4 |
| 44451.875 | 101.8 |
| 44451.885416666664 | 102.9 |
| 44451.895833333336 | 100.6 |
| 44451.90625 | 101.7 |
| 44451.916666666664 | 101.9 |
| 44451.927083333336 | 101.9 |
| 44451.9375 | 100.2 |
| 44451.947916666664 | 100.4 |
| 44451.958333333336 | 99.7 |
| 44451.96875 | 100.2 |
| 44451.979166666664 | 101.5 |
| 44451.989583333336 | 99.3 |
| 44452.0 | 97.4 |
| 44452.010416666664 | 99.5 |
| 44452.020833333336 | 95.4 |
| 44452.03125 | 21.1 |
| 44452.041666666664 | 39.1 |
| 44452.052083333336 | 39.8 |
| 44452.0625 | 38.6 |
| 44452.072916666664 | 36.8 |
| 44452.083333333336 | 47.8 |
| 44452.09375 | 51.7 |
| 44452.104166666664 | 49.3 |
| 44452.114583333336 | 52.6 |
| 44452.125 | 48.5 |
| 44452.135416666664 | 52.6 |
| 44452.145833333336 | 47.8 |
| 44452.15625 | 50.3 |
| 44452.166666666664 | 52.9 |
| 44452.177083333336 | 49.7 |
| 44452.1875 | 54.5 |
| 44452.197916666664 | 51.7 |
| 44452.208333333336 | 53.1 |
| 44452.21875 | 48.3 |
| 44452.229166666664 | 46 |
| 44452.239583333336 | 40.9 |
| 44452.25 | 47.4 |
| 44452.260416666664 | 57.1 |
| 44452.270833333336 | 54.1 |
| 44452.28125 | 54.5 |
| 44452.291666666664 | 56.3 |
| 44452.302083333336 | 62 |
| 44452.3125 | 60.6 |
| 44452.322916666664 | 63.8 |
| 44452.333333333336 | 68.5 |
| 44452.34375 | 72.3 |
| 44452.354166666664 | 67.1 |
| 44452.364583333336 | 74.6 |
| 44452.375 | 74.7 |
| 44452.385416666664 | 74.1 |
| 44452.395833333336 | 73.7 |
| 44452.40625 | 71.9 |
| 44452.416666666664 | 71.3 |
| 44452.427083333336 | 69.6 |
| 44452.4375 | 69.2 |
| 44452.447916666664 | 67 |
| 44452.458333333336 | 66.7 |
| 44452.46875 | 65.6 |
| 44452.479166666664 | 64.2 |
| 44452.489583333336 | 66.4 |
| 44452.5 | 63.5 |
| 44452.510416666664 | 52.6 |
| 44452.520833333336 | 59.5 |
| 44452.53125 | 60.9 |
| 44452.541666666664 | 62.6 |
| 44452.552083333336 | 62.2 |
| 44452.5625 | 61.8 |
| 44452.572916666664 | 60.8 |
| 44452.583333333336 | 62.6 |
| 44452.59375 | 62.9 |
| 44452.604166666664 | 65.8 |
| 44452.614583333336 | 69 |
| 44452.625 | 72.6 |
| 44452.635416666664 | 75.8 |
| 44452.645833333336 | 78.7 |
| 44452.65625 | 82.3 |
| 44452.666666666664 | 85.2 |
| 44452.677083333336 | 87.6 |
| 44452.6875 | 88.9 |
| 44452.697916666664 | 90.9 |
| 44452.708333333336 | 92.5 |
| 44452.71875 | 94 |
| 44452.729166666664 | 94.6 |
| 44452.739583333336 | 95.1 |
| 44452.75 | 94.1 |
| 44452.760416666664 | 95.6 |
| 44452.770833333336 | 92.9 |
| 44452.78125 | 89.5 |
| 44452.791666666664 | 93.5 |
| 44452.802083333336 | 95.8 |
| 44452.8125 | 100.3 |
| 44452.822916666664 | 102.1 |
| 44452.833333333336 | 101.8 |
| 44452.84375 | 103.3 |
| 44452.854166666664 | 105.9 |
| 44452.864583333336 | 106.3 |
| 44452.875 | 104.4 |
| 44452.885416666664 | 105.1 |
| 44452.895833333336 | 105.7 |
| 44452.90625 | 101.4 |
| 44452.916666666664 | 101.6 |
| 44452.927083333336 | 100.7 |
| 44452.9375 | 97.3 |
| 44452.947916666664 | 96 |
| 44452.958333333336 | 93.4 |
| 44452.96875 | 94.3 |
| 44452.979166666664 | 94.8 |
| 44452.989583333336 | 94.2 |
| 44453.0 | 94.8 |
| 44453.010416666664 | 93.8 |
| 44453.020833333336 | 93.1 |
| 44453.03125 | 92.6 |
| 44453.041666666664 | 92.5 |
| 44453.052083333336 | 87 |
| 44453.0625 | 66.4 |
| 44453.072916666664 | 9.4 |
| 44453.083333333336 | 25.6 |
| 44453.09375 | 41.9 |
| 44453.104166666664 | 41.6 |
| 44453.114583333336 | 46.7 |
| 44453.125 | 48.7 |
| 44453.135416666664 | 51.5 |
| 44453.145833333336 | 51.8 |
| 44453.15625 | 52.1 |
| 44453.166666666664 | 54.5 |
| 44453.177083333336 | 54 |
| 44453.1875 | 53.7 |
| 44453.197916666664 | 56.1 |
| 44453.208333333336 | 56.4 |
| 44453.21875 | 57.9 |
| 44453.229166666664 | 58 |
| 44453.239583333336 | 56 |
| 44453.25 | 50.4 |
| 44453.260416666664 | 49.4 |
| 44453.270833333336 | 42.4 |
| 44453.28125 | 38.1 |
| 44453.291666666664 | 36.2 |
| 44453.302083333336 | 34.8 |
| 44453.3125 | 60.3 |
| 44453.322916666664 | 61.1 |
| 44453.333333333336 | 65.8 |
| 44453.34375 | 60.7 |
| 44453.354166666664 | 60.1 |
| 44453.364583333336 | 59.4 |
| 44453.375 | 57.1 |
| 44453.385416666664 | 59 |
| 44453.395833333336 | 63.2 |
| 44453.40625 | 59 |
| 44453.416666666664 | 62.8 |
| 44453.427083333336 | 65.3 |
| 44453.4375 | 65.7 |
| 44453.447916666664 | 64.4 |
| 44453.458333333336 | 64 |
| 44453.46875 | 65.2 |
| 44453.479166666664 | 64.3 |
| 44453.489583333336 | 63.3 |
| 44453.5 | 63.8 |
| 44453.510416666664 | 63.2 |
| 44453.520833333336 | 62.3 |
| 44453.53125 | 62.1 |
| 44453.541666666664 | 61.5 |
| 44453.552083333336 | 60.9 |
| 44453.5625 | 61 |
| 44453.572916666664 | 60.6 |
| 44453.583333333336 | 59.1 |
| 44453.59375 | 59.2 |
| 44453.604166666664 | 60.7 |
| 44453.614583333336 | 62.8 |
| 44453.625 | 64.7 |
| 44453.635416666664 | 69.1 |
| 44453.645833333336 | 71 |
| 44453.65625 | 73.8 |
| 44453.666666666664 | 75.6 |
| 44453.677083333336 | 79.4 |
| 44453.6875 | 83.4 |
| 44453.697916666664 | 87.5 |
| 44453.708333333336 | 89.5 |
| 44453.71875 | 91.4 |
| 44453.729166666664 | 93.2 |
| 44453.739583333336 | 96.2 |
| 44453.75 | 97 |
| 44453.760416666664 | 98.6 |
| 44453.770833333336 | 99.4 |
| 44453.78125 | 101.3 |
| 44453.791666666664 | 101.4 |
| 44453.802083333336 | 103 |
| 44453.8125 | 102.6 |
| 44453.822916666664 | 101.6 |
| 44453.833333333336 | 98.5 |
| 44453.84375 | 101.6 |
| 44453.854166666664 | 103.1 |
| 44453.864583333336 | 100.8 |
| 44453.875 | 111.3 |
| 44453.885416666664 | 111.4 |
| 44453.895833333336 | 109.4 |
| 44453.90625 | 110.4 |
| 44453.916666666664 | 107.8 |
| 44453.927083333336 | 105.9 |
| 44453.9375 | 105 |
| 44453.947916666664 | 104.4 |
| 44453.958333333336 | 97.2 |
| 44453.96875 | 95.3 |
| 44453.979166666664 | 90.4 |
| 44453.989583333336 | 88.4 |
| 44454.0 | 86.9 |
| 44454.010416666664 | 85.2 |
| 44454.020833333336 | 86.9 |
| 44454.03125 | 88.3 |
| 44454.041666666664 | 86.5 |
| 44454.052083333336 | 85.6 |
| 44454.0625 | 84.4 |
| 44454.072916666664 | 83.9 |
| 44454.083333333336 | 83.2 |
| 44454.09375 | 81.1 |
| 44454.104166666664 | 76.2 |
| 44454.114583333336 | 26.2 |
| 44454.125 | 25.8 |
| 44454.135416666664 | 45 |
| 44454.145833333336 | 46.4 |
| 44454.15625 | 49.5 |
| 44454.166666666664 | 55.6 |
| 44454.177083333336 | 53.1 |
| 44454.1875 | 56.7 |
| 44454.197916666664 | 58.6 |
| 44454.208333333336 | 63.5 |
| 44454.21875 | 62.3 |
| 44454.229166666664 | 64.6 |
| 44454.239583333336 | 63.9 |
| 44454.25 | 63.4 |
| 44454.260416666664 | 61.8 |
| 44454.270833333336 | 60.1 |
| 44454.28125 | 61.7 |
| 44454.291666666664 | 59.9 |
| 44454.302083333336 | 57 |
| 44454.3125 | 53.7 |
| 44454.322916666664 | 55.5 |
| 44454.333333333336 | 52.7 |
| 44454.34375 | 50.5 |
| 44454.354166666664 | 59.9 |
| 44454.364583333336 | 66.1 |
| 44454.375 | 65.3 |
| 44454.385416666664 | 59.2 |
| 44454.395833333336 | 60.9 |
| 44454.40625 | 60.3 |
| 44454.416666666664 | 67.6 |
| 44454.427083333336 | 73.1 |
| 44454.4375 | 67 |
| 44454.447916666664 | 61.5 |
| 44454.458333333336 | 60.8 |
| 44454.46875 | 60.8 |
| 44454.479166666664 | 68.7 |
| 44454.489583333336 | 65 |
| 44454.5 | 66.4 |
| 44454.510416666664 | 67 |
| 44454.520833333336 | 66 |
| 44454.53125 | 65.5 |
| 44454.541666666664 | 65.1 |
| 44454.552083333336 | 65.3 |
| 44454.5625 | 65.8 |
| 44454.572916666664 | 66.9 |
| 44454.583333333336 | 68.1 |
| 44454.59375 | 68.6 |
| 44454.604166666664 | 67.5 |
| 44454.614583333336 | 66.4 |
| 44454.625 | 63.9 |
| 44454.635416666664 | 64.5 |
| 44454.645833333336 | 63.2 |
| 44454.65625 | 65.9 |
| 44454.666666666664 | 73.4 |
| 44454.677083333336 | 81.4 |
| 44454.6875 | 84.4 |
| 44454.697916666664 | 88.7 |
| 44454.708333333336 | 94.5 |
| 44454.71875 | 98.6 |
| 44454.729166666664 | 109.4 |
| 44454.739583333336 | 113.2 |
| 44454.75 | 117.2 |
| 44454.760416666664 | 117.9 |
| 44454.770833333336 | 118 |
| 44454.78125 | 118.2 |
| 44454.791666666664 | 117.1 |
| 44454.802083333336 | 116.6 |
| 44454.8125 | 115.6 |
| 44454.822916666664 | 114.6 |
| 44454.833333333336 | 113.5 |
| 44454.84375 | 112.8 |
| 44454.854166666664 | 112.3 |
| 44454.864583333336 | 111.9 |
| 44454.875 | 112 |
| 44454.885416666664 | 111.2 |
| 44454.895833333336 | 110.3 |
| 44454.90625 | 108.2 |
| 44454.916666666664 | 107.7 |
| 44454.927083333336 | 109.2 |
| 44454.9375 | 109.4 |
| 44454.947916666664 | 107.7 |
| 44454.958333333336 | 101.7 |
| 44454.96875 | 100.6 |
| 44454.979166666664 | 101 |
| 44454.989583333336 | 100.7 |
| 44455.0 | 98.3 |
| 44455.010416666664 | 94.6 |
| 44455.020833333336 | 92.1 |
| 44455.03125 | 93.6 |
| 44455.041666666664 | 91.8 |
| 44455.052083333336 | 90.7 |
| 44455.0625 | 90.8 |
| 44455.072916666664 | 89.1 |
| 44455.083333333336 | 87.7 |
| 44455.09375 | 86.5 |
| 44455.104166666664 | 85 |
| 44455.114583333336 | 84.4 |
| 44455.125 | 83.6 |
| 44455.135416666664 | 83.4 |
| 44455.145833333336 | 82.8 |
| 44455.15625 | 23.2 |
| 44455.166666666664 | 33.6 |
| 44455.177083333336 | 21.6 |
| 44455.1875 | 42.6 |
| 44455.197916666664 | 37.2 |
| 44455.208333333336 | 40.1 |
| 44455.21875 | 49.3 |
| 44455.229166666664 | 52.5 |
| 44455.239583333336 | 52.7 |
| 44455.25 | 53.2 |
| 44455.260416666664 | 55.1 |
| 44455.270833333336 | 55.1 |
| 44455.28125 | 53.8 |
| 44455.291666666664 | 57.5 |
| 44455.302083333336 | 55.7 |
| 44455.3125 | 53.7 |
| 44455.322916666664 | 59.3 |
| 44455.333333333336 | 59.6 |
| 44455.34375 | 55.3 |
| 44455.354166666664 | 53.4 |
| 44455.364583333336 | 47.1 |
| 44455.375 | 51.5 |
| 44455.385416666664 | 43.6 |
| 44455.395833333336 | 34.3 |
| 44455.40625 | 42.5 |
| 44455.416666666664 | 47.6 |
| 44455.427083333336 | 54.4 |
| 44455.4375 | 52.1 |
| 44455.447916666664 | 65.7 |
| 44455.458333333336 | 72.2 |
| 44455.46875 | 68.7 |
| 44455.479166666664 | 68.4 |
| 44455.489583333336 | 69.7 |
| 44455.5 | 66.7 |
| 44455.510416666664 | 65.6 |
| 44455.520833333336 | 63.5 |
| 44455.53125 | 64.8 |
| 44455.541666666664 | 66 |
| 44455.552083333336 | 65.6 |
| 44455.5625 | 64.1 |
| 44455.572916666664 | 62.7 |
| 44455.583333333336 | 63.1 |
| 44455.59375 | 63 |
| 44455.604166666664 | 62.9 |
| 44455.614583333336 | 63 |
| 44455.625 | 62.9 |
| 44455.635416666664 | 62.5 |
| 44455.645833333336 | 65.8 |
| 44455.65625 | 66.2 |
| 44455.666666666664 | 65.8 |
| 44455.677083333336 | 64.8 |
| 44455.6875 | 64.2 |
| 44455.697916666664 | 65.3 |
| 44455.708333333336 | 68.7 |
| 44455.71875 | 72 |
| 44455.729166666664 | 82.3 |
| 44455.739583333336 | 89.1 |
| 44455.75 | 97.1 |
| 44455.760416666664 | 101 |
| 44455.770833333336 | 104.2 |
| 44455.78125 | 109.5 |
| 44455.791666666664 | 113.8 |
| 44455.802083333336 | 120.4 |
| 44455.8125 | 121.2 |
| 44455.822916666664 | 125.6 |
| 44455.833333333336 | 123 |
| 44455.84375 | 122.5 |
| 44455.854166666664 | 120.9 |
| 44455.864583333336 | 119.2 |
| 44455.875 | 117.5 |
| 44455.885416666664 | 115.8 |
| 44455.895833333336 | 114.7 |
| 44455.90625 | 113.6 |
| 44455.916666666664 | 112.2 |
| 44455.927083333336 | 110 |
| 44455.9375 | 103.5 |
| 44455.947916666664 | 108.5 |
| 44455.958333333336 | 105.7 |
| 44455.96875 | 105.2 |
| 44455.979166666664 | 104.2 |
| 44455.989583333336 | 106.2 |
| 44456.0 | 104.1 |
| 44456.010416666664 | 104 |
| 44456.020833333336 | 102.5 |
| 44456.03125 | 97.7 |
| 44456.041666666664 | 94 |
| 44456.052083333336 | 88.8 |
| 44456.0625 | 84.7 |
| 44456.072916666664 | 83.4 |
| 44456.083333333336 | 82.5 |
| 44456.09375 | 79.6 |
| 44456.104166666664 | 80.1 |
| 44456.114583333336 | 79 |
| 44456.125 | 79.7 |
| 44456.135416666664 | 78.6 |
| 44456.145833333336 | 78.1 |
| 44456.15625 | 76.6 |
| 44456.166666666664 | 76.6 |
| 44456.177083333336 | 76.2 |
| 44456.1875 | 74.8 |
| 44456.197916666664 | 37.7 |
| 44456.208333333336 | 29.1 |
| 44456.21875 | 36.6 |
| 44456.229166666664 | 45.9 |
| 44456.239583333336 | 48.7 |
| 44456.25 | 48.7 |
| 44456.260416666664 | 49.9 |
| 44456.270833333336 | 51.3 |
| 44456.28125 | 55.4 |
| 44456.291666666664 | 56.8 |
| 44456.302083333336 | 61.8 |
| 44456.3125 | 61.5 |
| 44456.322916666664 | 62.3 |
| 44456.333333333336 | 62.1 |
| 44456.34375 | 63.8 |
| 44456.354166666664 | 65 |
| 44456.364583333336 | 64.8 |
| 44456.375 | 64.9 |
| 44456.385416666664 | 66.4 |
| 44456.395833333336 | 61.5 |
| 44456.40625 | 60.4 |
| 44456.416666666664 | 60.2 |
| 44456.427083333336 | 62 |
| 44456.4375 | 60.5 |
| 44456.447916666664 | 69.1 |
| 44456.458333333336 | 72 |
| 44456.46875 | 71.4 |
| 44456.479166666664 | 68.7 |
| 44456.489583333336 | 68.5 |
| 44456.5 | 69.6 |
| 44456.510416666664 | 69.2 |
| 44456.520833333336 | 69.7 |
| 44456.53125 | 67 |
| 44456.541666666664 | 65.3 |
| 44456.552083333336 | 65.4 |
| 44456.5625 | 66.5 |
| 44456.572916666664 | 64.7 |
| 44456.583333333336 | 65.2 |
| 44456.59375 | 66.4 |
| 44456.604166666664 | 70 |
| 44456.614583333336 | 73.6 |
| 44456.625 | 75.7 |
| 44456.635416666664 | 77.3 |
| 44456.645833333336 | 79.2 |
| 44456.65625 | 79.6 |
| 44456.666666666664 | 81.2 |
| 44456.677083333336 | 82 |
| 44456.6875 | 82.4 |
| 44456.697916666664 | 82.8 |
| 44456.708333333336 | 80.7 |
| 44456.71875 | 81 |
| 44456.729166666664 | 81.3 |
| 44456.739583333336 | 82.5 |
| 44456.75 | 83.1 |
| 44456.760416666664 | 83.4 |
| 44456.770833333336 | 85.9 |
| 44456.78125 | 89.5 |
| 44456.791666666664 | 93.4 |
| 44456.802083333336 | 102.2 |
| 44456.8125 | 106.2 |
| 44456.822916666664 | 106.9 |
| 44456.833333333336 | 108.5 |
| 44456.84375 | 111.9 |
| 44456.854166666664 | 114.8 |
| 44456.864583333336 | 115.6 |
| 44456.875 | 116.6 |
| 44456.885416666664 | 115.7 |
| 44456.895833333336 | 113.9 |
| 44456.90625 | 112.6 |
| 44456.916666666664 | 111.5 |
| 44456.927083333336 | 110.6 |
| 44456.9375 | 109.6 |
| 44456.947916666664 | 108 |
| 44456.958333333336 | 106.2 |
| 44456.96875 | 96.6 |
| 44456.979166666664 | 100.3 |
| 44456.989583333336 | 87.8 |
| 44457.0 | 93.7 |
| 44457.010416666664 | 84.7 |
| 44457.020833333336 | 87.3 |
| 44457.03125 | 94.2 |
| 44457.041666666664 | 92.2 |
| 44457.052083333336 | 76.4 |
| 44457.0625 | 60.1 |
| 44457.072916666664 | 72.7 |
| 44457.083333333336 | 86 |
| 44457.09375 | 70.2 |
| 44457.104166666664 | 80.8 |
| 44457.114583333336 | 62.1 |
| 44457.125 | 72 |
| 44457.135416666664 | 56.7 |
| 44457.145833333336 | 46 |
| 44457.15625 | 63.9 |
| 44457.166666666664 | 69.1 |
| 44457.177083333336 | 68.4 |
| 44457.1875 | 73.5 |
| 44457.197916666664 | 44.3 |
| 44457.208333333336 | 36.5 |
| 44457.21875 | 74.7 |
| 44457.229166666664 | 71.7 |
| 44457.239583333336 | 71.7 |
| 44457.25 | 39.7 |
| 44457.260416666664 | 25 |
| 44457.270833333336 | 45 |
| 44457.28125 | 52.6 |
| 44457.291666666664 | 55.6 |
| 44457.302083333336 | 56.4 |
| 44457.3125 | 56.7 |
| 44457.322916666664 | 59.8 |
| 44457.333333333336 | 62.3 |
| 44457.34375 | 62.9 |
| 44457.354166666664 | 64 |
| 44457.364583333336 | 63.1 |
| 44457.375 | 60.3 |
| 44457.385416666664 | 64.6 |
| 44457.395833333336 | 63.5 |
| 44457.40625 | 60.2 |
| 44457.416666666664 | 61.7 |
| 44457.427083333336 | 59.9 |
| 44457.4375 | 57.2 |
| 44457.447916666664 | 68.8 |
| 44457.458333333336 | 71.5 |
| 44457.46875 | 69.6 |
| 44457.479166666664 | 52.7 |
| 44457.489583333336 | 45.7 |
| 44457.5 | 48.2 |
| 44457.510416666664 | 48.6 |
| 44457.520833333336 | 51.2 |
| 44457.53125 | 54.1 |
| 44457.541666666664 | 49.1 |
| 44457.552083333336 | 63.1 |
| 44457.5625 | 61.9 |
| 44457.572916666664 | 53.2 |
| 44457.583333333336 | 53.2 |
| 44457.59375 | 51 |
| 44457.604166666664 | 58.2 |
| 44457.614583333336 | 58.1 |
| 44457.625 | 65.7 |
| 44457.635416666664 | 70.5 |
| 44457.645833333336 | 72.7 |
| 44457.65625 | 70.5 |
| 44457.666666666664 | 73.9 |
| 44457.677083333336 | 72.7 |
| 44457.6875 | 73.5 |
| 44457.697916666664 | 76.3 |
| 44457.708333333336 | 74.9 |
| 44457.71875 | 74.3 |
| 44457.729166666664 | 77.2 |
| 44457.739583333336 | 80.9 |
| 44457.75 | 76 |
| 44457.760416666664 | 76.4 |
| 44457.770833333336 | 76 |
| 44457.78125 | 76 |
| 44457.791666666664 | 75.8 |
| 44457.802083333336 | 79.7 |
| 44457.8125 | 85.8 |
| 44457.822916666664 | 90.6 |
| 44457.833333333336 | 93.1 |
| 44457.84375 | 97.9 |
| 44457.854166666664 | 102.2 |
| 44457.864583333336 | 106.5 |
| 44457.875 | 111.6 |
| 44457.885416666664 | 113 |
| 44457.895833333336 | 114.4 |
| 44457.90625 | 115.7 |
| 44457.916666666664 | 115.5 |
| 44457.927083333336 | 114.6 |
| 44457.9375 | 114.1 |
| 44457.947916666664 | 111.2 |
| 44457.958333333336 | 109.4 |
| 44457.96875 | 105.7 |
| 44457.979166666664 | 100 |
| 44457.989583333336 | 94.2 |
| 44458.0 | 90.3 |
| 44458.010416666664 | 87.6 |
| 44458.020833333336 | 93.8 |
| 44458.03125 | 98.4 |
| 44458.041666666664 | 99.1 |
| 44458.052083333336 | 97.5 |
| 44458.0625 | 97.1 |
| 44458.072916666664 | 97.2 |
| 44458.083333333336 | 96.2 |
| 44458.09375 | 93.3 |
| 44458.104166666664 | 90.3 |
| 44458.114583333336 | 87.7 |
| 44458.125 | 83.4 |
| 44458.135416666664 | 81.5 |
| 44458.145833333336 | 75 |
| 44458.15625 | 73.8 |
| 44458.166666666664 | 72.5 |
| 44458.177083333336 | 69.2 |
| 44458.1875 | 70.4 |
| 44458.197916666664 | 73.1 |
| 44458.208333333336 | 72.1 |
| 44458.21875 | 72.4 |
| 44458.229166666664 | 71 |
| 44458.239583333336 | 70.7 |
| 44458.25 | 69.7 |
| 44458.260416666664 | 68.8 |
| 44458.270833333336 | 66.3 |
| 44458.28125 | 63.1 |
| 44458.291666666664 | 43.1 |
| 44458.302083333336 | 56.3 |
| 44458.3125 | 59.1 |
| 44458.322916666664 | 58.6 |
| 44458.333333333336 | 62 |
| 44458.34375 | 62.2 |
| 44458.354166666664 | 65.2 |
| 44458.364583333336 | 65.7 |
| 44458.375 | 66.1 |
| 44458.385416666664 | 67.8 |
| 44458.395833333336 | 67.8 |
| 44458.40625 | 68.4 |
| 44458.416666666664 | 69.6 |
| 44458.427083333336 | 68.4 |
| 44458.4375 | 68.5 |
| 44458.447916666664 | 68.9 |
| 44458.458333333336 | 69.4 |
| 44458.46875 | 71.2 |
| 44458.479166666664 | 71.9 |
| 44458.489583333336 | 72.3 |
| 44458.5 | 69.5 |
| 44458.510416666664 | 68.2 |
| 44458.520833333336 | 69.3 |
| 44458.53125 | 69.9 |
| 44458.541666666664 | 72 |
| 44458.552083333336 | 73.5 |
| 44458.5625 | 71.5 |
| 44458.572916666664 | 69.3 |
| 44458.583333333336 | 70.5 |
| 44458.59375 | 69 |
| 44458.604166666664 | 72.8 |
| 44458.614583333336 | 73.4 |
| 44458.625 | 74.8 |
| 44458.635416666664 | 77.2 |
| 44458.645833333336 | 79.9 |
| 44458.65625 | 81.4 |
| 44458.666666666664 | 83.2 |
| 44458.677083333336 | 84.9 |
| 44458.6875 | 86.2 |
| 44458.697916666664 | 87 |
| 44458.708333333336 | 87.8 |
| 44458.71875 | 88.6 |
| 44458.729166666664 | 91 |
| 44458.739583333336 | 94.4 |
| 44458.75 | 94.8 |
| 44458.760416666664 | 95.6 |
| 44458.770833333336 | 92.7 |
| 44458.78125 | 94.2 |
| 44458.791666666664 | 90 |
| 44458.802083333336 | 88.3 |
| 44458.8125 | 87.8 |
| 44458.822916666664 | 88.5 |
| 44458.833333333336 | 91.4 |
| 44458.84375 | 95.3 |
| 44458.854166666664 | 100.5 |
| 44458.864583333336 | 108.7 |
| 44458.875 | 110.3 |
| 44458.885416666664 | 113.6 |
| 44458.895833333336 | 117 |
| 44458.90625 | 123.1 |
| 44458.916666666664 | 123.7 |
| 44458.927083333336 | 123 |
| 44458.9375 | 123.3 |
| 44458.947916666664 | 122.7 |
| 44458.958333333336 | 119.7 |
| 44458.96875 | 114.3 |
| 44458.979166666664 | 113.5 |
| 44458.989583333336 | 110.9 |
| 44459.0 | 109.7 |
| 44459.010416666664 | 107.5 |
| 44459.020833333336 | 105.2 |
| 44459.03125 | 102.8 |
| 44459.041666666664 | 100.9 |
| 44459.052083333336 | 101.1 |
| 44459.0625 | 101 |
| 44459.072916666664 | 102.7 |
| 44459.083333333336 | 101.8 |
| 44459.09375 | 101.6 |
| 44459.104166666664 | 100.3 |
| 44459.114583333336 | 98.2 |
| 44459.125 | 97.5 |
| 44459.135416666664 | 93.2 |
| 44459.145833333336 | 92.3 |
| 44459.15625 | 91.2 |
| 44459.166666666664 | 88.5 |
| 44459.177083333336 | 87.5 |
| 44459.1875 | 83.1 |
| 44459.197916666664 | 86.7 |
| 44459.208333333336 | 85.2 |
| 44459.21875 | 82.6 |
| 44459.229166666664 | 80.2 |
| 44459.239583333336 | 79.4 |
| 44459.25 | 77.6 |
| 44459.260416666664 | 76.5 |
| 44459.270833333336 | 74.7 |
| 44459.28125 | 73 |
| 44459.291666666664 | 71.6 |
| 44459.302083333336 | 70.6 |
| 44459.3125 | 59.7 |
| 44459.322916666664 | 62.1 |
| 44459.333333333336 | 67.2 |
| 44459.34375 | 68.6 |
| 44459.354166666664 | 69.4 |
| 44459.364583333336 | 70.1 |
| 44459.375 | 72.1 |
| 44459.385416666664 | 72.4 |
| 44459.395833333336 | 73.5 |
| 44459.40625 | 73.2 |
| 44459.416666666664 | 73.9 |
| 44459.427083333336 | 74.5 |
| 44459.4375 | 73.6 |
| 44459.447916666664 | 74.2 |
| 44459.458333333336 | 74.9 |
| 44459.46875 | 74.8 |
| 44459.479166666664 | 74.3 |
| 44459.489583333336 | 74.4 |
| 44459.5 | 75.8 |
| 44459.510416666664 | 76.6 |
| 44459.520833333336 | 76.2 |
| 44459.53125 | 76.4 |
| 44459.541666666664 | 77.4 |
| 44459.552083333336 | 77.7 |
| 44459.5625 | 74.3 |
| 44459.572916666664 | 79.2 |
| 44459.583333333336 | 80.6 |
| 44459.59375 | 82 |
| 44459.604166666664 | 82.1 |
| 44459.614583333336 | 82.1 |
| 44459.625 | 82.5 |
| 44459.635416666664 | 84.2 |
| 44459.645833333336 | 84.8 |
| 44459.65625 | 86.1 |
| 44459.666666666664 | 89.9 |
| 44459.677083333336 | 91.8 |
| 44459.6875 | 92.7 |
| 44459.697916666664 | 94.5 |
| 44459.708333333336 | 95.7 |
| 44459.71875 | 96.9 |
| 44459.729166666664 | 97.8 |
| 44459.739583333336 | 98.4 |
| 44459.75 | 99.2 |
| 44459.760416666664 | 99.4 |
| 44459.770833333336 | 98.5 |
| 44459.78125 | 98.4 |
| 44459.791666666664 | 98.8 |
| 44459.802083333336 | 98 |
| 44459.8125 | 94.6 |
| 44459.822916666664 | 95.6 |
| 44459.833333333336 | 94.5 |
| 44459.84375 | 95.9 |
| 44459.854166666664 | 94.8 |
| 44459.864583333336 | 95.4 |
| 44459.875 | 95.5 |
| 44459.885416666664 | 97.2 |
| 44459.895833333336 | 103.5 |
| 44459.90625 | 104.7 |
| 44459.916666666664 | 102.5 |
| 44459.927083333336 | 103.9 |
| 44459.9375 | 105.2 |
| 44459.947916666664 | 107.2 |
| 44459.958333333336 | 107.5 |
| 44459.96875 | 105.7 |
| 44459.979166666664 | 107.9 |
| 44459.989583333336 | 106 |
| 44460.0 | 104.2 |
| 44460.010416666664 | 102.1 |
| 44460.020833333336 | 100.4 |
| 44460.03125 | 97.9 |
| 44460.041666666664 | 99.2 |
| 44460.052083333336 | 96.5 |
| 44460.0625 | 97.3 |
| 44460.072916666664 | 93.2 |
| 44460.083333333336 | 96.6 |
| 44460.09375 | 97.3 |
| 44460.104166666664 | 97.7 |
| 44460.114583333336 | 96.8 |
| 44460.125 | 96.6 |
| 44460.135416666664 | 94.6 |
| 44460.145833333336 | 94.5 |
| 44460.15625 | 92 |
| 44460.166666666664 | 90.4 |
| 44460.177083333336 | 88.1 |
| 44460.1875 | 85.6 |
| 44460.197916666664 | 87.3 |
| 44460.208333333336 | 85.2 |
| 44460.21875 | 85 |
| 44460.229166666664 | 83.8 |
| 44460.239583333336 | 80.9 |
| 44460.25 | 80.6 |
| 44460.260416666664 | 81.8 |
| 44460.270833333336 | 80.5 |
| 44460.28125 | 80.6 |
| 44460.291666666664 | 80.3 |
| 44460.302083333336 | 79.6 |
| 44460.3125 | 78.8 |
| 44460.322916666664 | 78.4 |
| 44460.333333333336 | 76.6 |
| 44460.34375 | 75.6 |
| 44460.354166666664 | 60.1 |
| 44460.364583333336 | 71.4 |
| 44460.375 | 72.5 |
| 44460.385416666664 | 71.4 |
| 44460.395833333336 | 71.8 |
| 44460.40625 | 73 |
| 44460.416666666664 | 74 |
| 44460.427083333336 | 74.6 |
| 44460.4375 | 74.5 |
| 44460.447916666664 | 76.1 |
| 44460.458333333336 | 77.3 |
| 44460.46875 | 76.3 |
| 44460.479166666664 | 77.2 |
| 44460.489583333336 | 77.7 |
| 44460.5 | 78.3 |
| 44460.510416666664 | 77.7 |
| 44460.520833333336 | 79.2 |
| 44460.53125 | 80.6 |
| 44460.541666666664 | 82.6 |
| 44460.552083333336 | 83.3 |
| 44460.5625 | 84.1 |
| 44460.572916666664 | 84 |
| 44460.583333333336 | 85.2 |
| 44460.59375 | 85.9 |
| 44460.604166666664 | 86.4 |
| 44460.614583333336 | 87.7 |
| 44460.625 | 89.5 |
| 44460.635416666664 | 89.1 |
| 44460.645833333336 | 90.5 |
| 44460.65625 | 90.9 |
| 44460.666666666664 | 92.5 |
| 44460.677083333336 | 92 |
| 44460.6875 | 95.5 |
| 44460.697916666664 | 95.6 |
| 44460.708333333336 | 97.4 |
| 44460.71875 | 99.3 |
| 44460.729166666664 | 99.8 |
| 44460.739583333336 | 101.3 |
| 44460.75 | 101.8 |
| 44460.760416666664 | 103.2 |
| 44460.770833333336 | 104.7 |
| 44460.78125 | 105.8 |
| 44460.791666666664 | 106.2 |
| 44460.802083333336 | 107 |
| 44460.8125 | 107.2 |
| 44460.822916666664 | 107.9 |
| 44460.833333333336 | 108.9 |
| 44460.84375 | 106.8 |
| 44460.854166666664 | 103.9 |
| 44460.864583333336 | 103.5 |
| 44460.875 | 102.8 |
| 44460.885416666664 | 100.5 |
| 44460.895833333336 | 99.5 |
| 44460.90625 | 99 |
| 44460.916666666664 | 102.3 |
| 44460.927083333336 | 107 |
| 44460.9375 | 105.5 |
| 44460.947916666664 | 104.2 |
| 44460.958333333336 | 105.7 |
| 44460.96875 | 109.5 |
| 44460.979166666664 | 109.1 |
| 44460.989583333336 | 107 |
| 44461.0 | 104.6 |
| 44461.010416666664 | 103.8 |
| 44461.020833333336 | 102.4 |
| 44461.03125 | 100.3 |
| 44461.041666666664 | 98.3 |
| 44461.052083333336 | 97 |
| 44461.0625 | 93.2 |
| 44461.072916666664 | 92 |
| 44461.083333333336 | 91.4 |
| 44461.09375 | 91.3 |
| 44461.104166666664 | 91.1 |
| 44461.114583333336 | 92.3 |
| 44461.125 | 96.3 |
| 44461.135416666664 | 95.4 |
| 44461.145833333336 | 97.4 |
| 44461.15625 | 95.7 |
| 44461.166666666664 | 92.8 |
| 44461.177083333336 | 90.5 |
| 44461.1875 | 89.7 |
| 44461.197916666664 | 88.6 |
| 44461.208333333336 | 83.1 |
| 44461.21875 | 82.3 |
| 44461.229166666664 | 83.4 |
| 44461.239583333336 | 80.5 |
| 44461.25 | 81.1 |
| 44461.260416666664 | 82.2 |
| 44461.270833333336 | 81.3 |
| 44461.28125 | 80.9 |
| 44461.291666666664 | 79.7 |
| 44461.302083333336 | 79.6 |
| 44461.3125 | 79.8 |
| 44461.322916666664 | 79.5 |
| 44461.333333333336 | 79.4 |
| 44461.34375 | 79.1 |
| 44461.354166666664 | 75 |
| 44461.364583333336 | 41 |
| 44461.375 | 57.9 |
| 44461.385416666664 | 65.7 |
| 44461.395833333336 | 66.9 |
| 44461.40625 | 69.9 |
| 44461.416666666664 | 68.5 |
| 44461.427083333336 | 75.1 |
| 44461.4375 | 73.6 |
| 44461.447916666664 | 72.5 |
| 44461.458333333336 | 72.9 |
| 44461.46875 | 74.1 |
| 44461.479166666664 | 76.6 |
| 44461.489583333336 | 74.1 |
| 44461.5 | 77.2 |
| 44461.510416666664 | 77 |
| 44461.520833333336 | 77.2 |
| 44461.53125 | 78.1 |
| 44461.541666666664 | 79.6 |
| 44461.552083333336 | 82.2 |
| 44461.5625 | 81.7 |
| 44461.572916666664 | 84.9 |
| 44461.583333333336 | 85.4 |
| 44461.59375 | 85 |
| 44461.604166666664 | 84.5 |
| 44461.614583333336 | 85.2 |
| 44461.625 | 86 |
| 44461.635416666664 | 86.7 |
| 44461.645833333336 | 88.5 |
| 44461.65625 | 90.3 |
| 44461.666666666664 | 90.4 |
| 44461.677083333336 | 90.4 |
| 44461.6875 | 91.2 |
| 44461.697916666664 | 91.2 |
| 44461.708333333336 | 92.1 |
| 44461.71875 | 92.8 |
| 44461.729166666664 | 93.6 |
| 44461.739583333336 | 96.1 |
| 44461.75 | 96.5 |
| 44461.760416666664 | 96.6 |
| 44461.770833333336 | 96.5 |
| 44461.78125 | 97.8 |
| 44461.791666666664 | 98.7 |
| 44461.802083333336 | 99.1 |
| 44461.8125 | 99.4 |
| 44461.822916666664 | 99.3 |
| 44461.833333333336 | 99 |
| 44461.84375 | 99.3 |
| 44461.854166666664 | 98.5 |
| 44461.864583333336 | 98.1 |
| 44461.875 | 94.4 |
| 44461.885416666664 | 90.8 |
| 44461.895833333336 | 88.1 |
| 44461.90625 | 85.8 |
| 44461.916666666664 | 84 |
| 44461.927083333336 | 85.2 |
| 44461.9375 | 82.8 |
| 44461.947916666664 | 83.1 |
| 44461.958333333336 | 81 |
| 44461.96875 | 81.7 |
| 44461.979166666664 | 81.7 |
| 44461.989583333336 | 81.6 |
| 44462.0 | 84.1 |
| 44462.010416666664 | 79.7 |
| 44462.020833333336 | 80.6 |
| 44462.03125 | 82.6 |
| 44462.041666666664 | 81.2 |
| 44462.052083333336 | 83.7 |
| 44462.0625 | 81.7 |
| 44462.072916666664 | 88.4 |
| 44462.083333333336 | 83.9 |
| 44462.09375 | 88.1 |
| 44462.104166666664 | 82.6 |
| 44462.114583333336 | 89.8 |
| 44462.125 | 84.1 |
| 44462.135416666664 | 86 |
| 44462.145833333336 | 82.6 |
| 44462.15625 | 83.9 |
| 44462.166666666664 | 88.8 |
| 44462.177083333336 | 89.3 |
| 44462.1875 | 85.8 |
| 44462.197916666664 | 82.3 |
| 44462.208333333336 | 81.4 |
| 44462.21875 | 78.7 |
| 44462.229166666664 | 79.3 |
| 44462.239583333336 | 77.3 |
| 44462.25 | 79 |
| 44462.260416666664 | 79.4 |
| 44462.270833333336 | 78.6 |
| 44462.28125 | 78.7 |
| 44462.291666666664 | 79.6 |
| 44462.302083333336 | 79.4 |
| 44462.3125 | 79.3 |
| 44462.322916666664 | 79.5 |
| 44462.333333333336 | 79.5 |
| 44462.34375 | 79.1 |
| 44462.354166666664 | 79.3 |
| 44462.364583333336 | 78.6 |
| 44462.375 | 42.4 |
| 44462.385416666664 | 56.1 |
| 44462.395833333336 | 62.1 |
| 44462.40625 | 64.9 |
| 44462.416666666664 | 69.5 |
| 44462.427083333336 | 70.5 |
| 44462.4375 | 73.3 |
| 44462.447916666664 | 71.2 |
| 44462.458333333336 | 75 |
| 44462.46875 | 76.1 |
| 44462.479166666664 | 74.5 |
| 44462.489583333336 | 76.4 |
| 44462.5 | 77.5 |
| 44462.510416666664 | 82.4 |
| 44462.520833333336 | 83.1 |
| 44462.53125 | 81.9 |
| 44462.541666666664 | 83.3 |
| 44462.552083333336 | 84 |
| 44462.5625 | 84.3 |
| 44462.572916666664 | 83.8 |
| 44462.583333333336 | 84.5 |
| 44462.59375 | 85.2 |
| 44462.604166666664 | 84 |
| 44462.614583333336 | 84.6 |
| 44462.625 | 83.7 |
| 44462.635416666664 | 85.9 |
| 44462.645833333336 | 86.1 |
| 44462.65625 | 83.5 |
| 44462.666666666664 | 82.9 |
| 44462.677083333336 | 87 |
| 44462.6875 | 87.6 |
| 44462.697916666664 | 85.7 |
| 44462.708333333336 | 85.3 |
| 44462.71875 | 85.6 |
| 44462.729166666664 | 84.9 |
| 44462.739583333336 | 85.7 |
| 44462.75 | 85 |
| 44462.760416666664 | 84 |
| 44462.770833333336 | 82.2 |
| 44462.78125 | 82.1 |
| 44462.791666666664 | 82.1 |
| 44462.802083333336 | 81.8 |
| 44462.8125 | 82.5 |
| 44462.822916666664 | 81.5 |
| 44462.833333333336 | 81.5 |
| 44462.84375 | 80.6 |
| 44462.854166666664 | 80.4 |
| 44462.864583333336 | 77.8 |
| 44462.875 | 74.1 |
| 44462.885416666664 | 72.7 |
| 44462.895833333336 | 74 |
| 44462.90625 | 66.4 |
| 44462.916666666664 | 67.6 |
| 44462.927083333336 | 69 |
| 44462.9375 | 69.6 |
| 44462.947916666664 | 69.5 |
| 44462.958333333336 | 71 |
| 44462.96875 | 70.9 |
| 44462.979166666664 | 70.5 |
| 44462.989583333336 | 72.2 |
| 44463.0 | 70.5 |
| 44463.010416666664 | 70.7 |
| 44463.020833333336 | 70.8 |
| 44463.03125 | 69.4 |
| 44463.041666666664 | 68.2 |
| 44463.052083333336 | 68.3 |
| 44463.0625 | 67.3 |
| 44463.072916666664 | 67.9 |
| 44463.083333333336 | 67.7 |
| 44463.09375 | 67.5 |
| 44463.104166666664 | 68.9 |
| 44463.114583333336 | 64.4 |
| 44463.125 | 62.5 |
| 44463.135416666664 | 63.3 |
| 44463.145833333336 | 64.1 |
| 44463.15625 | 63.8 |
| 44463.166666666664 | 64.8 |
| 44463.177083333336 | 68.7 |
| 44463.1875 | 66.4 |
| 44463.197916666664 | 71.5 |
| 44463.208333333336 | 64.2 |
| 44463.21875 | 62.5 |
| 44463.229166666664 | 62 |
| 44463.239583333336 | 61.6 |
| 44463.25 | 58.4 |
| 44463.260416666664 | 56.2 |
| 44463.270833333336 | 54.5 |
| 44463.28125 | 54.3 |
| 44463.291666666664 | 57.4 |
| 44463.302083333336 | 56 |
| 44463.3125 | 58.2 |
| 44463.322916666664 | 60.4 |
| 44463.333333333336 | 63.2 |
| 44463.34375 | 62.7 |
| 44463.354166666664 | 63.5 |
| 44463.364583333336 | 63.4 |
| 44463.375 | 63.7 |
| 44463.385416666664 | 64.4 |
| 44463.395833333336 | 64.2 |
| 44463.40625 | 26.5 |
| 44463.416666666664 | 19.6 |
| 44463.427083333336 | 34.1 |
| 44463.4375 | 46.8 |
| 44463.447916666664 | 53.9 |
| 44463.458333333336 | 57.9 |
| 44463.46875 | 59.3 |
| 44463.479166666664 | 61.9 |
| 44463.489583333336 | 64.7 |
| 44463.5 | 65.7 |
| 44463.510416666664 | 67.1 |
| 44463.520833333336 | 67.5 |
| 44463.53125 | 68.6 |
| 44463.541666666664 | 70.2 |
| 44463.552083333336 | 70.9 |
| 44463.5625 | 71.7 |
| 44463.572916666664 | 72.7 |
| 44463.583333333336 | 74.1 |
| 44463.59375 | 75.2 |
| 44463.604166666664 | 76.1 |
| 44463.614583333336 | 76.7 |
| 44463.625 | 77.6 |
| 44463.635416666664 | 79.3 |
| 44463.645833333336 | 80 |
| 44463.65625 | 79.4 |
| 44463.666666666664 | 81.3 |
| 44463.677083333336 | 81.7 |
| 44463.6875 | 82.4 |
| 44463.697916666664 | 84.4 |
| 44463.708333333336 | 85.6 |
| 44463.71875 | 87.2 |
| 44463.729166666664 | 88.5 |
| 44463.739583333336 | 88.6 |
| 44463.75 | 89.5 |
| 44463.760416666664 | 89.8 |
| 44463.770833333336 | 90.4 |
| 44463.78125 | 91.8 |
| 44463.791666666664 | 93.5 |
| 44463.802083333336 | 95.5 |
| 44463.8125 | 95.8 |
| 44463.822916666664 | 97.4 |
| 44463.833333333336 | 98.5 |
| 44463.84375 | 98.7 |
| 44463.854166666664 | 99 |
| 44463.864583333336 | 99.3 |
| 44463.875 | 99.3 |
| 44463.885416666664 | 99.1 |
| 44463.895833333336 | 99.4 |
| 44463.90625 | 99.2 |
| 44463.916666666664 | 100 |
| 44463.927083333336 | 99.8 |
| 44463.9375 | 90.9 |
| 44463.947916666664 | 83.2 |
| 44463.958333333336 | 76.4 |
| 44463.96875 | 81.3 |
| 44463.979166666664 | 87.2 |
| 44463.989583333336 | 86.6 |
| 44464.0 | 83.1 |
| 44464.010416666664 | 82.4 |
| 44464.020833333336 | 88.4 |
| 44464.03125 | 87.3 |
| 44464.041666666664 | 86.1 |
| 44464.052083333336 | 83.7 |
| 44464.0625 | 81.2 |
| 44464.072916666664 | 78.5 |
| 44464.083333333336 | 78 |
| 44464.09375 | 76.2 |
| 44464.104166666664 | 75.7 |
| 44464.114583333336 | 73.7 |
| 44464.125 | 72.7 |
| 44464.135416666664 | 70.3 |
| 44464.145833333336 | 71.4 |
| 44464.15625 | 67.2 |
| 44464.166666666664 | 67.6 |
| 44464.177083333336 | 70.8 |
| 44464.1875 | 74.4 |
| 44464.197916666664 | 75.2 |
| 44464.208333333336 | 76 |
| 44464.21875 | 78.4 |
| 44464.229166666664 | 81.2 |
| 44464.239583333336 | 77.8 |
| 44464.25 | 78.3 |
| 44464.260416666664 | 80.4 |
| 44464.270833333336 | 74.5 |
| 44464.28125 | 74.6 |
| 44464.291666666664 | 74.4 |
| 44464.302083333336 | 72.1 |
| 44464.3125 | 76.1 |
| 44464.322916666664 | 75 |
| 44464.333333333336 | 77.8 |
| 44464.34375 | 74.9 |
| 44464.354166666664 | 76.1 |
| 44464.364583333336 | 76.5 |
| 44464.375 | 75.9 |
| 44464.385416666664 | 76.1 |
| 44464.395833333336 | 76.6 |
| 44464.40625 | 76.1 |
| 44464.416666666664 | 76 |
| 44464.427083333336 | 46.1 |
| 44464.4375 | 31.8 |
| 44464.447916666664 | 46.9 |
| 44464.458333333336 | 64.2 |
| 44464.46875 | 67.8 |
| 44464.479166666664 | 68.1 |
| 44464.489583333336 | 66.8 |
| 44464.5 | 68.9 |
| 44464.510416666664 | 71.7 |
| 44464.520833333336 | 72.4 |
| 44464.53125 | 72.6 |
| 44464.541666666664 | 72.5 |
| 44464.552083333336 | 72.7 |
| 44464.5625 | 73.1 |
| 44464.572916666664 | 73.2 |
| 44464.583333333336 | 73.6 |
| 44464.59375 | 74.3 |
| 44464.604166666664 | 75.6 |
| 44464.614583333336 | 76.9 |
| 44464.625 | 79.6 |
| 44464.635416666664 | 80.5 |
| 44464.645833333336 | 81.9 |
| 44464.65625 | 84.3 |
| 44464.666666666664 | 85.8 |
| 44464.677083333336 | 86.8 |
| 44464.6875 | 87.7 |
| 44464.697916666664 | 88.2 |
| 44464.708333333336 | 88 |
| 44464.71875 | 90.2 |
| 44464.729166666664 | 91.9 |
| 44464.739583333336 | 92.8 |
| 44464.75 | 93.7 |
| 44464.760416666664 | 93.2 |
| 44464.770833333336 | 91.6 |
| 44464.78125 | 93.1 |
| 44464.791666666664 | 93.8 |
| 44464.802083333336 | 93.9 |
| 44464.8125 | 97 |
| 44464.822916666664 | 97.6 |
| 44464.833333333336 | 98.5 |
| 44464.84375 | 99.3 |
| 44464.854166666664 | 99.8 |
| 44464.864583333336 | 100.2 |
| 44464.875 | 99.9 |
| 44464.885416666664 | 100.7 |
| 44464.895833333336 | 101.7 |
| 44464.90625 | 101.7 |
| 44464.916666666664 | 101.4 |
| 44464.927083333336 | 102.5 |
| 44464.9375 | 101.8 |
| 44464.947916666664 | 102.3 |
| 44464.958333333336 | 94.5 |
| 44464.96875 | 82.8 |
| 44464.979166666664 | 86.5 |
| 44464.989583333336 | 89.5 |
| 44465.0 | 83.4 |
| 44465.010416666664 | 81.9 |
| 44465.020833333336 | 77.6 |
| 44465.03125 | 72.9 |
| 44465.041666666664 | 80.5 |
| 44465.052083333336 | 82.3 |
| 44465.0625 | 84.9 |
| 44465.072916666664 | 82.4 |
| 44465.083333333336 | 80 |
| 44465.09375 | 77.6 |
| 44465.104166666664 | 77.5 |
| 44465.114583333336 | 78.2 |
| 44465.125 | 75.8 |
| 44465.135416666664 | 77.2 |
| 44465.145833333336 | 77.2 |
| 44465.15625 | 73.8 |
| 44465.166666666664 | 72.2 |
| 44465.177083333336 | 74.7 |
| 44465.1875 | 72.3 |
| 44465.197916666664 | 69.1 |
| 44465.208333333336 | 72.5 |
| 44465.21875 | 76 |
| 44465.229166666664 | 81 |
| 44465.239583333336 | 76.4 |
| 44465.25 | 79.1 |
| 44465.260416666664 | 78.5 |
| 44465.270833333336 | 76.8 |
| 44465.28125 | 82.8 |
| 44465.291666666664 | 78.9 |
| 44465.302083333336 | 76.6 |
| 44465.3125 | 77.8 |
| 44465.322916666664 | 81.3 |
| 44465.333333333336 | 80.2 |
| 44465.34375 | 81.2 |
| 44465.354166666664 | 78.5 |
| 44465.364583333336 | 77.9 |
| 44465.375 | 77.5 |
| 44465.385416666664 | 76.2 |
| 44465.395833333336 | 78 |
| 44465.40625 | 79.5 |
| 44465.416666666664 | 79.5 |
| 44465.427083333336 | 79 |
| 44465.4375 | 78.1 |
| 44465.447916666664 | 73.5 |
| 44465.458333333336 | 63.7 |
| 44465.46875 | 42.9 |
| 44465.479166666664 | 54.1 |
| 44465.489583333336 | 66.2 |
| 44465.5 | 67.7 |
| 44465.510416666664 | 69.2 |
| 44465.520833333336 | 69.3 |
| 44465.53125 | 69.6 |
| 44465.541666666664 | 72 |
| 44465.552083333336 | 75.1 |
| 44465.5625 | 75.8 |
| 44465.572916666664 | 76.3 |
| 44465.583333333336 | 76.9 |
| 44465.59375 | 77.5 |
| 44465.604166666664 | 78.2 |
| 44465.614583333336 | 79.9 |
| 44465.625 | 80.1 |
| 44465.635416666664 | 81.8 |
| 44465.645833333336 | 82.7 |
| 44465.65625 | 84.4 |
| 44465.666666666664 | 86.6 |
| 44465.677083333336 | 88.4 |
| 44465.6875 | 89.1 |
| 44465.697916666664 | 91.6 |
| 44465.708333333336 | 92.8 |
| 44465.71875 | 94.1 |
| 44465.729166666664 | 85.4 |
| 44465.739583333336 | 93.9 |
| 44465.75 | 94.8 |
| 44465.760416666664 | 95.3 |
| 44465.770833333336 | 97.6 |
| 44465.78125 | 97.6 |
| 44465.791666666664 | 98.3 |
| 44465.802083333336 | 99.4 |
| 44465.8125 | 100.9 |
| 44465.822916666664 | 100.8 |
| 44465.833333333336 | 101.7 |
| 44465.84375 | 103.8 |
| 44465.854166666664 | 104.4 |
| 44465.864583333336 | 102.9 |
| 44465.875 | 103.3 |
| 44465.885416666664 | 102.8 |
| 44465.895833333336 | 103.1 |
| 44465.90625 | 104 |
| 44465.916666666664 | 103.9 |
| 44465.927083333336 | 104.9 |
| 44465.9375 | 106.5 |
| 44465.947916666664 | 106.8 |
| 44465.958333333336 | 106.5 |
| 44465.96875 | 105.8 |
| 44465.979166666664 | 105.6 |
| 44465.989583333336 | 104.7 |
| 44466.0 | 94.1 |
| 44466.010416666664 | 77.2 |
| 44466.020833333336 | 59.3 |
| 44466.03125 | 72.4 |
| 44466.041666666664 | 72.4 |
| 44466.052083333336 | 75.9 |
| 44466.0625 | 73.9 |
| 44466.072916666664 | 77.7 |
| 44466.083333333336 | 79.4 |
| 44466.09375 | 80.9 |
| 44466.104166666664 | 82.4 |
| 44466.114583333336 | 82.7 |
| 44466.125 | 80.1 |
| 44466.135416666664 | 79.4 |
| 44466.145833333336 | 80.7 |
| 44466.15625 | 78 |
| 44466.166666666664 | 76.6 |
| 44466.177083333336 | 74.5 |
| 44466.1875 | 75.3 |
| 44466.197916666664 | 69.6 |
| 44466.208333333336 | 71.9 |
| 44466.21875 | 70.8 |
| 44466.229166666664 | 74.2 |
| 44466.239583333336 | 78.7 |
| 44466.25 | 79.5 |
| 44466.260416666664 | 87.4 |
| 44466.270833333336 | 84.7 |
| 44466.28125 | 82.8 |
| 44466.291666666664 | 86.1 |
| 44466.302083333336 | 85.6 |
| 44466.3125 | 82.3 |
| 44466.322916666664 | 84.5 |
| 44466.333333333336 | 85 |
| 44466.34375 | 81 |
| 44466.354166666664 | 80.7 |
| 44466.364583333336 | 81.6 |
| 44466.375 | 80 |
| 44466.385416666664 | 79.3 |
| 44466.395833333336 | 80.5 |
| 44466.40625 | 79.4 |
| 44466.416666666664 | 79.2 |
| 44466.427083333336 | 80.1 |
| 44466.4375 | 79.5 |
| 44466.447916666664 | 79.5 |
| 44466.458333333336 | 78.6 |
| 44466.46875 | 78 |
| 44466.479166666664 | 77.3 |
| 44466.489583333336 | 76.6 |
| 44466.5 | 69.4 |
| 44466.510416666664 | 60 |
| 44466.520833333336 | 70 |
| 44466.53125 | 69.2 |
| 44466.541666666664 | 71.6 |
| 44466.552083333336 | 72.6 |
| 44466.5625 | 73.5 |
| 44466.572916666664 | 74.6 |
| 44466.583333333336 | 76.3 |
| 44466.59375 | 77.6 |
| 44466.604166666664 | 78.7 |
| 44466.614583333336 | 80.2 |
| 44466.625 | 81.4 |
| 44466.635416666664 | 83.2 |
| 44466.645833333336 | 84.4 |
| 44466.65625 | 86.6 |
| 44466.666666666664 | 87.9 |
| 44466.677083333336 | 90.2 |
| 44466.6875 | 92.2 |
| 44466.697916666664 | 94.3 |
| 44466.708333333336 | 94.4 |
| 44466.71875 | 97.1 |
| 44466.729166666664 | 98 |
| 44466.739583333336 | 98.5 |
| 44466.75 | 99 |
| 44466.760416666664 | 99.3 |
| 44466.770833333336 | 98.7 |
| 44466.78125 | 102.6 |
| 44466.791666666664 | 102.8 |
| 44466.802083333336 | 104.6 |
| 44466.8125 | 106.5 |
| 44466.822916666664 | 107.3 |
| 44466.833333333336 | 105.6 |
| 44466.84375 | 105.3 |
| 44466.854166666664 | 103.3 |
| 44466.864583333336 | 104.6 |
| 44466.875 | 104 |
| 44466.885416666664 | 102.9 |
| 44466.895833333336 | 102.2 |
| 44466.90625 | 102.7 |
| 44466.916666666664 | 102.4 |
| 44466.927083333336 | 103.1 |
| 44466.9375 | 103.2 |
| 44466.947916666664 | 102.9 |
| 44466.958333333336 | 103 |
| 44466.96875 | 103.7 |
| 44466.979166666664 | 103.7 |
| 44466.989583333336 | 103.7 |
| 44467.0 | 103.5 |
| 44467.010416666664 | 103.2 |
| 44467.020833333336 | 103 |
| 44467.03125 | 96.3 |
| 44467.041666666664 | 65.4 |
| 44467.052083333336 | 28.5 |
| 44467.0625 | 44.2 |
| 44467.072916666664 | 55.8 |
| 44467.083333333336 | 63.1 |
| 44467.09375 | 60.2 |
| 44467.104166666664 | 53.9 |
| 44467.114583333336 | 56.3 |
| 44467.125 | 57.9 |
| 44467.135416666664 | 65.3 |
| 44467.145833333336 | 64.7 |
| 44467.15625 | 65.8 |
| 44467.166666666664 | 70.5 |
| 44467.177083333336 | 69.9 |
| 44467.1875 | 68.9 |
| 44467.197916666664 | 68.5 |
| 44467.208333333336 | 65.5 |
| 44467.21875 | 58.7 |
| 44467.229166666664 | 58.7 |
| 44467.239583333336 | 69.9 |
| 44467.25 | 71.5 |
| 44467.260416666664 | 74.7 |
| 44467.270833333336 | 72.3 |
| 44467.28125 | 77.5 |
| 44467.291666666664 | 81.5 |
| 44467.302083333336 | 82.5 |
| 44467.3125 | 82.5 |
| 44467.322916666664 | 81.4 |
| 44467.333333333336 | 82.1 |
| 44467.34375 | 83.4 |
| 44467.354166666664 | 79.4 |
| 44467.364583333336 | 81.1 |
| 44467.375 | 84.4 |
| 44467.385416666664 | 83.9 |
| 44467.395833333336 | 81.5 |
| 44467.40625 | 80.8 |
| 44467.416666666664 | 82.7 |
| 44467.427083333336 | 82.3 |
| 44467.4375 | 81.2 |
| 44467.447916666664 | 79.2 |
| 44467.458333333336 | 78.8 |
| 44467.46875 | 78.8 |
| 44467.479166666664 | 78.9 |
| 44467.489583333336 | 77.4 |
| 44467.5 | 78.7 |
| 44467.510416666664 | 79 |
| 44467.520833333336 | 74.7 |
| 44467.53125 | 65 |
| 44467.541666666664 | 69.4 |
| 44467.552083333336 | 71.2 |
| 44467.5625 | 71.7 |
| 44467.572916666664 | 70.6 |
| 44467.583333333336 | 71.8 |
| 44467.59375 | 73.7 |
| 44467.604166666664 | 74.6 |
| 44467.614583333336 | 76.3 |
| 44467.625 | 78.6 |
| 44467.635416666664 | 81.8 |
| 44467.645833333336 | 83.5 |
| 44467.65625 | 85.1 |
| 44467.666666666664 | 87.2 |
| 44467.677083333336 | 89.4 |
| 44467.6875 | 93.3 |
| 44467.697916666664 | 95.3 |
| 44467.708333333336 | 96.3 |
| 44467.71875 | 97.8 |
| 44467.729166666664 | 98.8 |
| 44467.739583333336 | 100.3 |
| 44467.75 | 101.4 |
| 44467.760416666664 | 104.7 |
| 44467.770833333336 | 104.7 |
| 44467.78125 | 103.7 |
| 44467.791666666664 | 102 |
| 44467.802083333336 | 96 |
| 44467.8125 | 108.4 |
| 44467.822916666664 | 105.6 |
| 44467.833333333336 | 112.4 |
| 44467.84375 | 113.7 |
| 44467.854166666664 | 112.6 |
| 44467.864583333336 | 110.1 |
| 44467.875 | 107.9 |
| 44467.885416666664 | 106.3 |
| 44467.895833333336 | 104.6 |
| 44467.90625 | 102.5 |
| 44467.916666666664 | 101.6 |
| 44467.927083333336 | 98.5 |
| 44467.9375 | 99.4 |
| 44467.947916666664 | 100 |
| 44467.958333333336 | 101.1 |
| 44467.96875 | 100.2 |
| 44467.979166666664 | 100.8 |
| 44467.989583333336 | 101.1 |
| 44468.0 | 101.3 |
| 44468.010416666664 | 101.5 |
| 44468.020833333336 | 101.5 |
| 44468.03125 | 101.2 |
| 44468.041666666664 | 100.7 |
| 44468.052083333336 | 100.1 |
| 44468.0625 | 72.8 |
| 44468.072916666664 | 34.2 |
| 44468.083333333336 | 41 |
| 44468.09375 | 48.8 |
| 44468.104166666664 | 57.4 |
| 44468.114583333336 | 54.2 |
| 44468.125 | 54.4 |
| 44468.135416666664 | 59.3 |
| 44468.145833333336 | 63.3 |
| 44468.15625 | 63.2 |
| 44468.166666666664 | 67.9 |
| 44468.177083333336 | 72.2 |
| 44468.1875 | 75.6 |
| 44468.197916666664 | 73.3 |
| 44468.208333333336 | 73.9 |
| 44468.21875 | 67.7 |
| 44468.229166666664 | 71.8 |
| 44468.239583333336 | 69.2 |
| 44468.25 | 67.5 |
| 44468.260416666664 | 63 |
| 44468.270833333336 | 59.4 |
| 44468.28125 | 68.7 |
| 44468.291666666664 | 71.1 |
| 44468.302083333336 | 80.9 |
| 44468.3125 | 75.6 |
| 44468.322916666664 | 74.3 |
| 44468.333333333336 | 76 |
| 44468.34375 | 69.7 |
| 44468.354166666664 | 71.1 |
| 44468.364583333336 | 68.7 |
| 44468.375 | 68.8 |
| 44468.385416666664 | 71.2 |
| 44468.395833333336 | 68.5 |
| 44468.40625 | 74.4 |
| 44468.416666666664 | 70 |
| 44468.427083333336 | 73.1 |
| 44468.4375 | 76.6 |
| 44468.447916666664 | 71.6 |
| 44468.458333333336 | 71.2 |
| 44468.46875 | 74.1 |
| 44468.479166666664 | 72.8 |
| 44468.489583333336 | 75.6 |
| 44468.5 | 74.7 |
| 44468.510416666664 | 75.2 |
| 44468.520833333336 | 75.2 |
| 44468.53125 | 74.9 |
| 44468.541666666664 | 75.8 |
| 44468.552083333336 | 75.5 |
| 44468.5625 | 70.3 |
| 44468.572916666664 | 68 |
| 44468.583333333336 | 69.8 |
| 44468.59375 | 69 |
| 44468.604166666664 | 69.2 |
| 44468.614583333336 | 69.9 |
| 44468.625 | 72.4 |
| 44468.635416666664 | 74 |
| 44468.645833333336 | 78 |
| 44468.65625 | 80.9 |
| 44468.666666666664 | 84.1 |
| 44468.677083333336 | 85.4 |
| 44468.6875 | 88.1 |
| 44468.697916666664 | 90 |
| 44468.708333333336 | 91.7 |
| 44468.71875 | 92.8 |
| 44468.729166666664 | 94.3 |
| 44468.739583333336 | 95.3 |
| 44468.75 | 96.3 |
| 44468.760416666664 | 97.9 |
| 44468.770833333336 | 98.9 |
| 44468.78125 | 100 |
| 44468.791666666664 | 100.9 |
| 44468.802083333336 | 100.5 |
| 44468.8125 | 101.9 |
| 44468.822916666664 | 100.5 |
| 44468.833333333336 | 94.8 |
| 44468.84375 | 99.3 |
| 44468.854166666664 | 103.6 |
| 44468.864583333336 | 104.7 |
| 44468.875 | 105.5 |
| 44468.885416666664 | 105.8 |
| 44468.895833333336 | 105.4 |
| 44468.90625 | 104.6 |
| 44468.916666666664 | 104.3 |
| 44468.927083333336 | 102.9 |
| 44468.9375 | 102.2 |
| 44468.947916666664 | 97.1 |
| 44468.958333333336 | 96.2 |
| 44468.96875 | 96.1 |
| 44468.979166666664 | 95.2 |
| 44468.989583333336 | 95.2 |
| 44469.0 | 92.8 |
| 44469.010416666664 | 91.6 |
| 44469.020833333336 | 90.6 |
| 44469.03125 | 92.8 |
| 44469.041666666664 | 92.4 |
| 44469.052083333336 | 95.4 |
| 44469.0625 | 94.4 |
| 44469.072916666664 | 92.9 |
| 44469.083333333336 | 93.3 |
| 44469.09375 | 94.1 |
| 44469.104166666664 | 92.5 |
| 44469.114583333336 | 75.4 |
| 44469.125 | 48.3 |
| 44469.135416666664 | 55.6 |
| 44469.145833333336 | 68.6 |
| 44469.15625 | 72.1 |
| 44469.166666666664 | 72.3 |
| 44469.177083333336 | 71.3 |
| 44469.1875 | 73.5 |
| 44469.197916666664 | 73.6 |
| 44469.208333333336 | 71 |
| 44469.21875 | 71 |
| 44469.229166666664 | 72.4 |
| 44469.239583333336 | 73.2 |
| 44469.25 | 72.1 |
| 44469.260416666664 | 67.9 |
| 44469.270833333336 | 68.5 |
| 44469.28125 | 68.7 |
| 44469.291666666664 | 64.9 |
| 44469.302083333336 | 62.9 |
| 44469.3125 | 60 |
| 44469.322916666664 | 59.3 |
| 44469.333333333336 | 62.2 |
| 44469.34375 | 64.5 |
| 44469.354166666664 | 70.5 |
| 44469.364583333336 | 82.6 |
| 44469.375 | 79.8 |
| 44469.385416666664 | 82.9 |
| 44469.395833333336 | 83.1 |
| 44469.40625 | 79.4 |
| 44469.416666666664 | 79.6 |
| 44469.427083333336 | 77.8 |
| 44469.4375 | 78.3 |
| 44469.447916666664 | 77.7 |
| 44469.458333333336 | 74 |
| 44469.46875 | 74.1 |
| 44469.479166666664 | 73.4 |
| 44469.489583333336 | 72.8 |
| 44469.5 | 74.4 |
| 44469.510416666664 | 73.4 |
| 44469.520833333336 | 74.5 |
| 44469.53125 | 74.7 |
| 44469.541666666664 | 74.7 |
| 44469.552083333336 | 77.5 |
| 44469.5625 | 72.8 |
| 44469.572916666664 | 71.8 |
| 44469.583333333336 | 70.4 |
| 44469.59375 | 70 |
| 44469.604166666664 | 70.5 |
| 44469.614583333336 | 70.4 |
| 44469.625 | 72 |
| 44469.635416666664 | 73.2 |
| 44469.645833333336 | 72.5 |
| 44469.65625 | 74.1 |
| 44469.666666666664 | 77.4 |
| 44469.677083333336 | 81.1 |
| 44469.6875 | 83.3 |
| 44469.697916666664 | 85.8 |
| 44469.708333333336 | 87.2 |
| 44469.71875 | 88.5 |
| 44469.729166666664 | 90.8 |
| 44469.739583333336 | 91.3 |
| 44469.75 | 95.7 |
| 44469.760416666664 | 95.8 |
| 44469.770833333336 | 97.5 |
| 44469.78125 | 98.4 |
| 44469.791666666664 | 99.5 |
| 44469.802083333336 | 100.1 |
| 44469.8125 | 102.6 |
| 44469.822916666664 | 105.5 |
| 44469.833333333336 | 105.5 |
| 44469.84375 | 105.4 |
| 44469.854166666664 | 105.5 |
| 44469.864583333336 | 106.2 |
| 44469.875 | 107.2 |
| 44469.885416666664 | 106.6 |
| 44469.895833333336 | 106.9 |
| 44469.90625 | 105.4 |
| 44469.916666666664 | 103.9 |
| 44469.927083333336 | 103.8 |
| 44469.9375 | 104.1 |
| 44469.947916666664 | 101.9 |
| 44469.958333333336 | 100.7 |
| 44469.96875 | 97.6 |
| 44469.979166666664 | 89.9 |
| 44469.989583333336 | 91.5 |
| 44470.0 | 91.1 |
| 44470.010416666664 | 90 |
| 44470.020833333336 | 89.2 |
| 44470.03125 | 86.7 |
| 44470.041666666664 | 87 |
| 44470.052083333336 | 85.5 |
| 44470.0625 | 82.7 |
| 44470.072916666664 | 88 |
| 44470.083333333336 | 82.8 |
| 44470.09375 | 87.9 |
| 44470.104166666664 | 82.7 |
| 44470.114583333336 | 85 |
| 44470.125 | 85.4 |
| 44470.135416666664 | 67.9 |
| 44470.145833333336 | 61.2 |
| 44470.15625 | 63.3 |